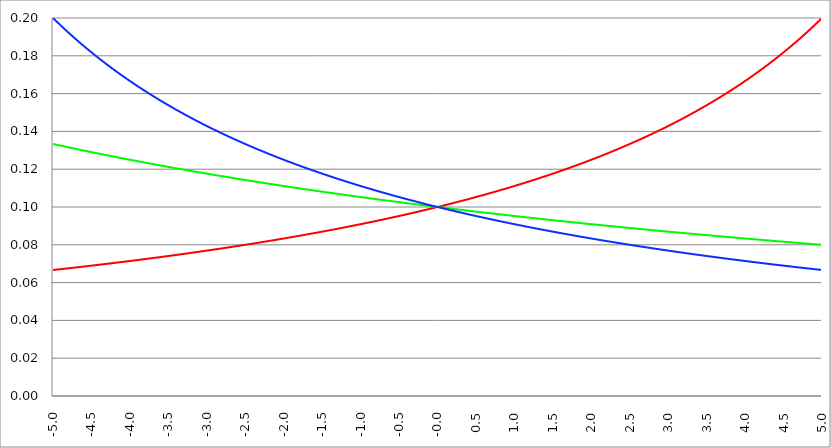
| Category | Series 1 | Series 0 | Series 2 |
|---|---|---|---|
| -5.0 | 0.067 | 0.133 | 0.2 |
| -4.995 | 0.067 | 0.133 | 0.2 |
| -4.99 | 0.067 | 0.133 | 0.2 |
| -4.985 | 0.067 | 0.133 | 0.199 |
| -4.98 | 0.067 | 0.133 | 0.199 |
| -4.975 | 0.067 | 0.133 | 0.199 |
| -4.97 | 0.067 | 0.133 | 0.199 |
| -4.965000000000001 | 0.067 | 0.133 | 0.199 |
| -4.960000000000001 | 0.067 | 0.133 | 0.198 |
| -4.955000000000001 | 0.067 | 0.133 | 0.198 |
| -4.950000000000001 | 0.067 | 0.133 | 0.198 |
| -4.945000000000001 | 0.067 | 0.133 | 0.198 |
| -4.940000000000001 | 0.067 | 0.133 | 0.198 |
| -4.935000000000001 | 0.067 | 0.133 | 0.197 |
| -4.930000000000001 | 0.067 | 0.133 | 0.197 |
| -4.925000000000002 | 0.067 | 0.133 | 0.197 |
| -4.920000000000002 | 0.067 | 0.133 | 0.197 |
| -4.915000000000002 | 0.067 | 0.133 | 0.197 |
| -4.910000000000002 | 0.067 | 0.133 | 0.196 |
| -4.905000000000002 | 0.067 | 0.132 | 0.196 |
| -4.900000000000002 | 0.067 | 0.132 | 0.196 |
| -4.895000000000002 | 0.067 | 0.132 | 0.196 |
| -4.890000000000002 | 0.067 | 0.132 | 0.196 |
| -4.885000000000002 | 0.067 | 0.132 | 0.196 |
| -4.880000000000002 | 0.067 | 0.132 | 0.195 |
| -4.875000000000003 | 0.067 | 0.132 | 0.195 |
| -4.870000000000003 | 0.067 | 0.132 | 0.195 |
| -4.865000000000003 | 0.067 | 0.132 | 0.195 |
| -4.860000000000003 | 0.067 | 0.132 | 0.195 |
| -4.855000000000003 | 0.067 | 0.132 | 0.194 |
| -4.850000000000003 | 0.067 | 0.132 | 0.194 |
| -4.845000000000003 | 0.067 | 0.132 | 0.194 |
| -4.840000000000003 | 0.067 | 0.132 | 0.194 |
| -4.835000000000003 | 0.067 | 0.132 | 0.194 |
| -4.830000000000004 | 0.067 | 0.132 | 0.193 |
| -4.825000000000004 | 0.067 | 0.132 | 0.193 |
| -4.820000000000004 | 0.067 | 0.132 | 0.193 |
| -4.815000000000004 | 0.067 | 0.132 | 0.193 |
| -4.810000000000004 | 0.068 | 0.132 | 0.193 |
| -4.805000000000004 | 0.068 | 0.132 | 0.192 |
| -4.800000000000004 | 0.068 | 0.132 | 0.192 |
| -4.795000000000004 | 0.068 | 0.132 | 0.192 |
| -4.790000000000004 | 0.068 | 0.131 | 0.192 |
| -4.785000000000004 | 0.068 | 0.131 | 0.192 |
| -4.780000000000004 | 0.068 | 0.131 | 0.192 |
| -4.775000000000004 | 0.068 | 0.131 | 0.191 |
| -4.770000000000004 | 0.068 | 0.131 | 0.191 |
| -4.765000000000005 | 0.068 | 0.131 | 0.191 |
| -4.760000000000005 | 0.068 | 0.131 | 0.191 |
| -4.755000000000005 | 0.068 | 0.131 | 0.191 |
| -4.750000000000005 | 0.068 | 0.131 | 0.19 |
| -4.745000000000005 | 0.068 | 0.131 | 0.19 |
| -4.740000000000005 | 0.068 | 0.131 | 0.19 |
| -4.735000000000005 | 0.068 | 0.131 | 0.19 |
| -4.730000000000005 | 0.068 | 0.131 | 0.19 |
| -4.725000000000006 | 0.068 | 0.131 | 0.19 |
| -4.720000000000006 | 0.068 | 0.131 | 0.189 |
| -4.715000000000006 | 0.068 | 0.131 | 0.189 |
| -4.710000000000006 | 0.068 | 0.131 | 0.189 |
| -4.705000000000006 | 0.068 | 0.131 | 0.189 |
| -4.700000000000006 | 0.068 | 0.131 | 0.189 |
| -4.695000000000006 | 0.068 | 0.131 | 0.189 |
| -4.690000000000006 | 0.068 | 0.131 | 0.188 |
| -4.685000000000007 | 0.068 | 0.131 | 0.188 |
| -4.680000000000007 | 0.068 | 0.131 | 0.188 |
| -4.675000000000007 | 0.068 | 0.131 | 0.188 |
| -4.670000000000007 | 0.068 | 0.13 | 0.188 |
| -4.665000000000007 | 0.068 | 0.13 | 0.187 |
| -4.660000000000007 | 0.068 | 0.13 | 0.187 |
| -4.655000000000007 | 0.068 | 0.13 | 0.187 |
| -4.650000000000007 | 0.068 | 0.13 | 0.187 |
| -4.645000000000007 | 0.068 | 0.13 | 0.187 |
| -4.640000000000008 | 0.068 | 0.13 | 0.187 |
| -4.635000000000008 | 0.068 | 0.13 | 0.186 |
| -4.630000000000008 | 0.068 | 0.13 | 0.186 |
| -4.625000000000008 | 0.068 | 0.13 | 0.186 |
| -4.620000000000008 | 0.068 | 0.13 | 0.186 |
| -4.615000000000008 | 0.068 | 0.13 | 0.186 |
| -4.610000000000008 | 0.068 | 0.13 | 0.186 |
| -4.605000000000008 | 0.068 | 0.13 | 0.185 |
| -4.600000000000008 | 0.068 | 0.13 | 0.185 |
| -4.595000000000009 | 0.069 | 0.13 | 0.185 |
| -4.590000000000009 | 0.069 | 0.13 | 0.185 |
| -4.585000000000009 | 0.069 | 0.13 | 0.185 |
| -4.580000000000009 | 0.069 | 0.13 | 0.185 |
| -4.57500000000001 | 0.069 | 0.13 | 0.184 |
| -4.57000000000001 | 0.069 | 0.13 | 0.184 |
| -4.565000000000009 | 0.069 | 0.13 | 0.184 |
| -4.560000000000009 | 0.069 | 0.13 | 0.184 |
| -4.555000000000009 | 0.069 | 0.129 | 0.184 |
| -4.55000000000001 | 0.069 | 0.129 | 0.183 |
| -4.54500000000001 | 0.069 | 0.129 | 0.183 |
| -4.54000000000001 | 0.069 | 0.129 | 0.183 |
| -4.53500000000001 | 0.069 | 0.129 | 0.183 |
| -4.53000000000001 | 0.069 | 0.129 | 0.183 |
| -4.52500000000001 | 0.069 | 0.129 | 0.183 |
| -4.52000000000001 | 0.069 | 0.129 | 0.182 |
| -4.51500000000001 | 0.069 | 0.129 | 0.182 |
| -4.51000000000001 | 0.069 | 0.129 | 0.182 |
| -4.505000000000011 | 0.069 | 0.129 | 0.182 |
| -4.500000000000011 | 0.069 | 0.129 | 0.182 |
| -4.495000000000011 | 0.069 | 0.129 | 0.182 |
| -4.490000000000011 | 0.069 | 0.129 | 0.181 |
| -4.485000000000011 | 0.069 | 0.129 | 0.181 |
| -4.480000000000011 | 0.069 | 0.129 | 0.181 |
| -4.475000000000011 | 0.069 | 0.129 | 0.181 |
| -4.470000000000011 | 0.069 | 0.129 | 0.181 |
| -4.465000000000011 | 0.069 | 0.129 | 0.181 |
| -4.460000000000011 | 0.069 | 0.129 | 0.181 |
| -4.455000000000012 | 0.069 | 0.129 | 0.18 |
| -4.450000000000012 | 0.069 | 0.129 | 0.18 |
| -4.445000000000012 | 0.069 | 0.129 | 0.18 |
| -4.440000000000012 | 0.069 | 0.129 | 0.18 |
| -4.435000000000012 | 0.069 | 0.128 | 0.18 |
| -4.430000000000012 | 0.069 | 0.128 | 0.18 |
| -4.425000000000012 | 0.069 | 0.128 | 0.179 |
| -4.420000000000012 | 0.069 | 0.128 | 0.179 |
| -4.415000000000012 | 0.069 | 0.128 | 0.179 |
| -4.410000000000013 | 0.069 | 0.128 | 0.179 |
| -4.405000000000013 | 0.069 | 0.128 | 0.179 |
| -4.400000000000013 | 0.069 | 0.128 | 0.179 |
| -4.395000000000013 | 0.069 | 0.128 | 0.178 |
| -4.390000000000013 | 0.069 | 0.128 | 0.178 |
| -4.385000000000013 | 0.07 | 0.128 | 0.178 |
| -4.380000000000013 | 0.07 | 0.128 | 0.178 |
| -4.375000000000013 | 0.07 | 0.128 | 0.178 |
| -4.370000000000013 | 0.07 | 0.128 | 0.178 |
| -4.365000000000013 | 0.07 | 0.128 | 0.177 |
| -4.360000000000014 | 0.07 | 0.128 | 0.177 |
| -4.355000000000014 | 0.07 | 0.128 | 0.177 |
| -4.350000000000014 | 0.07 | 0.128 | 0.177 |
| -4.345000000000014 | 0.07 | 0.128 | 0.177 |
| -4.340000000000014 | 0.07 | 0.128 | 0.177 |
| -4.335000000000014 | 0.07 | 0.128 | 0.177 |
| -4.330000000000014 | 0.07 | 0.128 | 0.176 |
| -4.325000000000014 | 0.07 | 0.128 | 0.176 |
| -4.320000000000014 | 0.07 | 0.128 | 0.176 |
| -4.315000000000015 | 0.07 | 0.128 | 0.176 |
| -4.310000000000015 | 0.07 | 0.127 | 0.176 |
| -4.305000000000015 | 0.07 | 0.127 | 0.176 |
| -4.300000000000015 | 0.07 | 0.127 | 0.175 |
| -4.295000000000015 | 0.07 | 0.127 | 0.175 |
| -4.290000000000015 | 0.07 | 0.127 | 0.175 |
| -4.285000000000015 | 0.07 | 0.127 | 0.175 |
| -4.280000000000015 | 0.07 | 0.127 | 0.175 |
| -4.275000000000015 | 0.07 | 0.127 | 0.175 |
| -4.270000000000015 | 0.07 | 0.127 | 0.175 |
| -4.265000000000016 | 0.07 | 0.127 | 0.174 |
| -4.260000000000016 | 0.07 | 0.127 | 0.174 |
| -4.255000000000016 | 0.07 | 0.127 | 0.174 |
| -4.250000000000016 | 0.07 | 0.127 | 0.174 |
| -4.245000000000016 | 0.07 | 0.127 | 0.174 |
| -4.240000000000016 | 0.07 | 0.127 | 0.174 |
| -4.235000000000016 | 0.07 | 0.127 | 0.173 |
| -4.230000000000016 | 0.07 | 0.127 | 0.173 |
| -4.225000000000017 | 0.07 | 0.127 | 0.173 |
| -4.220000000000017 | 0.07 | 0.127 | 0.173 |
| -4.215000000000017 | 0.07 | 0.127 | 0.173 |
| -4.210000000000017 | 0.07 | 0.127 | 0.173 |
| -4.205000000000017 | 0.07 | 0.127 | 0.173 |
| -4.200000000000017 | 0.07 | 0.127 | 0.172 |
| -4.195000000000017 | 0.07 | 0.127 | 0.172 |
| -4.190000000000017 | 0.07 | 0.127 | 0.172 |
| -4.185000000000017 | 0.07 | 0.126 | 0.172 |
| -4.180000000000017 | 0.071 | 0.126 | 0.172 |
| -4.175000000000018 | 0.071 | 0.126 | 0.172 |
| -4.170000000000018 | 0.071 | 0.126 | 0.172 |
| -4.165000000000018 | 0.071 | 0.126 | 0.171 |
| -4.160000000000018 | 0.071 | 0.126 | 0.171 |
| -4.155000000000018 | 0.071 | 0.126 | 0.171 |
| -4.150000000000018 | 0.071 | 0.126 | 0.171 |
| -4.145000000000018 | 0.071 | 0.126 | 0.171 |
| -4.140000000000018 | 0.071 | 0.126 | 0.171 |
| -4.135000000000018 | 0.071 | 0.126 | 0.171 |
| -4.130000000000019 | 0.071 | 0.126 | 0.17 |
| -4.125000000000019 | 0.071 | 0.126 | 0.17 |
| -4.120000000000019 | 0.071 | 0.126 | 0.17 |
| -4.115000000000019 | 0.071 | 0.126 | 0.17 |
| -4.110000000000019 | 0.071 | 0.126 | 0.17 |
| -4.105000000000019 | 0.071 | 0.126 | 0.17 |
| -4.100000000000019 | 0.071 | 0.126 | 0.169 |
| -4.095000000000019 | 0.071 | 0.126 | 0.169 |
| -4.090000000000019 | 0.071 | 0.126 | 0.169 |
| -4.085000000000019 | 0.071 | 0.126 | 0.169 |
| -4.08000000000002 | 0.071 | 0.126 | 0.169 |
| -4.07500000000002 | 0.071 | 0.126 | 0.169 |
| -4.07000000000002 | 0.071 | 0.126 | 0.169 |
| -4.06500000000002 | 0.071 | 0.126 | 0.168 |
| -4.06000000000002 | 0.071 | 0.125 | 0.168 |
| -4.05500000000002 | 0.071 | 0.125 | 0.168 |
| -4.05000000000002 | 0.071 | 0.125 | 0.168 |
| -4.04500000000002 | 0.071 | 0.125 | 0.168 |
| -4.04000000000002 | 0.071 | 0.125 | 0.168 |
| -4.03500000000002 | 0.071 | 0.125 | 0.168 |
| -4.03000000000002 | 0.071 | 0.125 | 0.168 |
| -4.025000000000021 | 0.071 | 0.125 | 0.167 |
| -4.020000000000021 | 0.071 | 0.125 | 0.167 |
| -4.015000000000021 | 0.071 | 0.125 | 0.167 |
| -4.010000000000021 | 0.071 | 0.125 | 0.167 |
| -4.005000000000021 | 0.071 | 0.125 | 0.167 |
| -4.000000000000021 | 0.071 | 0.125 | 0.167 |
| -3.995000000000021 | 0.071 | 0.125 | 0.167 |
| -3.990000000000021 | 0.071 | 0.125 | 0.166 |
| -3.985000000000022 | 0.072 | 0.125 | 0.166 |
| -3.980000000000022 | 0.072 | 0.125 | 0.166 |
| -3.975000000000022 | 0.072 | 0.125 | 0.166 |
| -3.970000000000022 | 0.072 | 0.125 | 0.166 |
| -3.965000000000022 | 0.072 | 0.125 | 0.166 |
| -3.960000000000022 | 0.072 | 0.125 | 0.166 |
| -3.955000000000022 | 0.072 | 0.125 | 0.165 |
| -3.950000000000022 | 0.072 | 0.125 | 0.165 |
| -3.945000000000022 | 0.072 | 0.125 | 0.165 |
| -3.940000000000023 | 0.072 | 0.125 | 0.165 |
| -3.935000000000023 | 0.072 | 0.124 | 0.165 |
| -3.930000000000023 | 0.072 | 0.124 | 0.165 |
| -3.925000000000023 | 0.072 | 0.124 | 0.165 |
| -3.920000000000023 | 0.072 | 0.124 | 0.164 |
| -3.915000000000023 | 0.072 | 0.124 | 0.164 |
| -3.910000000000023 | 0.072 | 0.124 | 0.164 |
| -3.905000000000023 | 0.072 | 0.124 | 0.164 |
| -3.900000000000023 | 0.072 | 0.124 | 0.164 |
| -3.895000000000023 | 0.072 | 0.124 | 0.164 |
| -3.890000000000024 | 0.072 | 0.124 | 0.164 |
| -3.885000000000024 | 0.072 | 0.124 | 0.164 |
| -3.880000000000024 | 0.072 | 0.124 | 0.163 |
| -3.875000000000024 | 0.072 | 0.124 | 0.163 |
| -3.870000000000024 | 0.072 | 0.124 | 0.163 |
| -3.865000000000024 | 0.072 | 0.124 | 0.163 |
| -3.860000000000024 | 0.072 | 0.124 | 0.163 |
| -3.855000000000024 | 0.072 | 0.124 | 0.163 |
| -3.850000000000024 | 0.072 | 0.124 | 0.163 |
| -3.845000000000025 | 0.072 | 0.124 | 0.162 |
| -3.840000000000025 | 0.072 | 0.124 | 0.162 |
| -3.835000000000025 | 0.072 | 0.124 | 0.162 |
| -3.830000000000025 | 0.072 | 0.124 | 0.162 |
| -3.825000000000025 | 0.072 | 0.124 | 0.162 |
| -3.820000000000025 | 0.072 | 0.124 | 0.162 |
| -3.815000000000025 | 0.072 | 0.124 | 0.162 |
| -3.810000000000025 | 0.072 | 0.124 | 0.162 |
| -3.805000000000025 | 0.072 | 0.123 | 0.161 |
| -3.800000000000026 | 0.072 | 0.123 | 0.161 |
| -3.795000000000026 | 0.072 | 0.123 | 0.161 |
| -3.790000000000026 | 0.073 | 0.123 | 0.161 |
| -3.785000000000026 | 0.073 | 0.123 | 0.161 |
| -3.780000000000026 | 0.073 | 0.123 | 0.161 |
| -3.775000000000026 | 0.073 | 0.123 | 0.161 |
| -3.770000000000026 | 0.073 | 0.123 | 0.161 |
| -3.765000000000026 | 0.073 | 0.123 | 0.16 |
| -3.760000000000026 | 0.073 | 0.123 | 0.16 |
| -3.755000000000026 | 0.073 | 0.123 | 0.16 |
| -3.750000000000027 | 0.073 | 0.123 | 0.16 |
| -3.745000000000027 | 0.073 | 0.123 | 0.16 |
| -3.740000000000027 | 0.073 | 0.123 | 0.16 |
| -3.735000000000027 | 0.073 | 0.123 | 0.16 |
| -3.730000000000027 | 0.073 | 0.123 | 0.159 |
| -3.725000000000027 | 0.073 | 0.123 | 0.159 |
| -3.720000000000027 | 0.073 | 0.123 | 0.159 |
| -3.715000000000027 | 0.073 | 0.123 | 0.159 |
| -3.710000000000027 | 0.073 | 0.123 | 0.159 |
| -3.705000000000028 | 0.073 | 0.123 | 0.159 |
| -3.700000000000028 | 0.073 | 0.123 | 0.159 |
| -3.695000000000028 | 0.073 | 0.123 | 0.159 |
| -3.690000000000028 | 0.073 | 0.123 | 0.158 |
| -3.685000000000028 | 0.073 | 0.123 | 0.158 |
| -3.680000000000028 | 0.073 | 0.123 | 0.158 |
| -3.675000000000028 | 0.073 | 0.123 | 0.158 |
| -3.670000000000028 | 0.073 | 0.122 | 0.158 |
| -3.665000000000028 | 0.073 | 0.122 | 0.158 |
| -3.660000000000028 | 0.073 | 0.122 | 0.158 |
| -3.655000000000029 | 0.073 | 0.122 | 0.158 |
| -3.650000000000029 | 0.073 | 0.122 | 0.157 |
| -3.645000000000029 | 0.073 | 0.122 | 0.157 |
| -3.640000000000029 | 0.073 | 0.122 | 0.157 |
| -3.635000000000029 | 0.073 | 0.122 | 0.157 |
| -3.630000000000029 | 0.073 | 0.122 | 0.157 |
| -3.625000000000029 | 0.073 | 0.122 | 0.157 |
| -3.620000000000029 | 0.073 | 0.122 | 0.157 |
| -3.615000000000029 | 0.073 | 0.122 | 0.157 |
| -3.61000000000003 | 0.073 | 0.122 | 0.156 |
| -3.60500000000003 | 0.074 | 0.122 | 0.156 |
| -3.60000000000003 | 0.074 | 0.122 | 0.156 |
| -3.59500000000003 | 0.074 | 0.122 | 0.156 |
| -3.59000000000003 | 0.074 | 0.122 | 0.156 |
| -3.58500000000003 | 0.074 | 0.122 | 0.156 |
| -3.58000000000003 | 0.074 | 0.122 | 0.156 |
| -3.57500000000003 | 0.074 | 0.122 | 0.156 |
| -3.57000000000003 | 0.074 | 0.122 | 0.156 |
| -3.565000000000031 | 0.074 | 0.122 | 0.155 |
| -3.560000000000031 | 0.074 | 0.122 | 0.155 |
| -3.555000000000031 | 0.074 | 0.122 | 0.155 |
| -3.550000000000031 | 0.074 | 0.122 | 0.155 |
| -3.545000000000031 | 0.074 | 0.122 | 0.155 |
| -3.540000000000031 | 0.074 | 0.122 | 0.155 |
| -3.535000000000031 | 0.074 | 0.121 | 0.155 |
| -3.530000000000031 | 0.074 | 0.121 | 0.155 |
| -3.525000000000031 | 0.074 | 0.121 | 0.154 |
| -3.520000000000032 | 0.074 | 0.121 | 0.154 |
| -3.515000000000032 | 0.074 | 0.121 | 0.154 |
| -3.510000000000032 | 0.074 | 0.121 | 0.154 |
| -3.505000000000032 | 0.074 | 0.121 | 0.154 |
| -3.500000000000032 | 0.074 | 0.121 | 0.154 |
| -3.495000000000032 | 0.074 | 0.121 | 0.154 |
| -3.490000000000032 | 0.074 | 0.121 | 0.154 |
| -3.485000000000032 | 0.074 | 0.121 | 0.153 |
| -3.480000000000032 | 0.074 | 0.121 | 0.153 |
| -3.475000000000032 | 0.074 | 0.121 | 0.153 |
| -3.470000000000033 | 0.074 | 0.121 | 0.153 |
| -3.465000000000033 | 0.074 | 0.121 | 0.153 |
| -3.460000000000033 | 0.074 | 0.121 | 0.153 |
| -3.455000000000033 | 0.074 | 0.121 | 0.153 |
| -3.450000000000033 | 0.074 | 0.121 | 0.153 |
| -3.445000000000033 | 0.074 | 0.121 | 0.153 |
| -3.440000000000033 | 0.074 | 0.121 | 0.152 |
| -3.435000000000033 | 0.074 | 0.121 | 0.152 |
| -3.430000000000033 | 0.074 | 0.121 | 0.152 |
| -3.425000000000034 | 0.074 | 0.121 | 0.152 |
| -3.420000000000034 | 0.075 | 0.121 | 0.152 |
| -3.415000000000034 | 0.075 | 0.121 | 0.152 |
| -3.410000000000034 | 0.075 | 0.121 | 0.152 |
| -3.405000000000034 | 0.075 | 0.121 | 0.152 |
| -3.400000000000034 | 0.075 | 0.12 | 0.152 |
| -3.395000000000034 | 0.075 | 0.12 | 0.151 |
| -3.390000000000034 | 0.075 | 0.12 | 0.151 |
| -3.385000000000034 | 0.075 | 0.12 | 0.151 |
| -3.380000000000034 | 0.075 | 0.12 | 0.151 |
| -3.375000000000035 | 0.075 | 0.12 | 0.151 |
| -3.370000000000035 | 0.075 | 0.12 | 0.151 |
| -3.365000000000035 | 0.075 | 0.12 | 0.151 |
| -3.360000000000035 | 0.075 | 0.12 | 0.151 |
| -3.355000000000035 | 0.075 | 0.12 | 0.15 |
| -3.350000000000035 | 0.075 | 0.12 | 0.15 |
| -3.345000000000035 | 0.075 | 0.12 | 0.15 |
| -3.340000000000035 | 0.075 | 0.12 | 0.15 |
| -3.335000000000035 | 0.075 | 0.12 | 0.15 |
| -3.330000000000036 | 0.075 | 0.12 | 0.15 |
| -3.325000000000036 | 0.075 | 0.12 | 0.15 |
| -3.320000000000036 | 0.075 | 0.12 | 0.15 |
| -3.315000000000036 | 0.075 | 0.12 | 0.15 |
| -3.310000000000036 | 0.075 | 0.12 | 0.149 |
| -3.305000000000036 | 0.075 | 0.12 | 0.149 |
| -3.300000000000036 | 0.075 | 0.12 | 0.149 |
| -3.295000000000036 | 0.075 | 0.12 | 0.149 |
| -3.290000000000036 | 0.075 | 0.12 | 0.149 |
| -3.285000000000036 | 0.075 | 0.12 | 0.149 |
| -3.280000000000036 | 0.075 | 0.12 | 0.149 |
| -3.275000000000037 | 0.075 | 0.12 | 0.149 |
| -3.270000000000037 | 0.075 | 0.12 | 0.149 |
| -3.265000000000037 | 0.075 | 0.12 | 0.148 |
| -3.260000000000037 | 0.075 | 0.119 | 0.148 |
| -3.255000000000037 | 0.075 | 0.119 | 0.148 |
| -3.250000000000037 | 0.075 | 0.119 | 0.148 |
| -3.245000000000037 | 0.076 | 0.119 | 0.148 |
| -3.240000000000037 | 0.076 | 0.119 | 0.148 |
| -3.235000000000038 | 0.076 | 0.119 | 0.148 |
| -3.230000000000038 | 0.076 | 0.119 | 0.148 |
| -3.225000000000038 | 0.076 | 0.119 | 0.148 |
| -3.220000000000038 | 0.076 | 0.119 | 0.147 |
| -3.215000000000038 | 0.076 | 0.119 | 0.147 |
| -3.210000000000038 | 0.076 | 0.119 | 0.147 |
| -3.205000000000038 | 0.076 | 0.119 | 0.147 |
| -3.200000000000038 | 0.076 | 0.119 | 0.147 |
| -3.195000000000038 | 0.076 | 0.119 | 0.147 |
| -3.190000000000039 | 0.076 | 0.119 | 0.147 |
| -3.185000000000039 | 0.076 | 0.119 | 0.147 |
| -3.180000000000039 | 0.076 | 0.119 | 0.147 |
| -3.175000000000039 | 0.076 | 0.119 | 0.147 |
| -3.170000000000039 | 0.076 | 0.119 | 0.146 |
| -3.16500000000004 | 0.076 | 0.119 | 0.146 |
| -3.16000000000004 | 0.076 | 0.119 | 0.146 |
| -3.155000000000039 | 0.076 | 0.119 | 0.146 |
| -3.150000000000039 | 0.076 | 0.119 | 0.146 |
| -3.14500000000004 | 0.076 | 0.119 | 0.146 |
| -3.14000000000004 | 0.076 | 0.119 | 0.146 |
| -3.13500000000004 | 0.076 | 0.119 | 0.146 |
| -3.13000000000004 | 0.076 | 0.119 | 0.146 |
| -3.12500000000004 | 0.076 | 0.119 | 0.145 |
| -3.12000000000004 | 0.076 | 0.118 | 0.145 |
| -3.11500000000004 | 0.076 | 0.118 | 0.145 |
| -3.11000000000004 | 0.076 | 0.118 | 0.145 |
| -3.10500000000004 | 0.076 | 0.118 | 0.145 |
| -3.10000000000004 | 0.076 | 0.118 | 0.145 |
| -3.095000000000041 | 0.076 | 0.118 | 0.145 |
| -3.090000000000041 | 0.076 | 0.118 | 0.145 |
| -3.085000000000041 | 0.076 | 0.118 | 0.145 |
| -3.080000000000041 | 0.076 | 0.118 | 0.145 |
| -3.075000000000041 | 0.076 | 0.118 | 0.144 |
| -3.070000000000041 | 0.077 | 0.118 | 0.144 |
| -3.065000000000041 | 0.077 | 0.118 | 0.144 |
| -3.060000000000041 | 0.077 | 0.118 | 0.144 |
| -3.055000000000041 | 0.077 | 0.118 | 0.144 |
| -3.050000000000042 | 0.077 | 0.118 | 0.144 |
| -3.045000000000042 | 0.077 | 0.118 | 0.144 |
| -3.040000000000042 | 0.077 | 0.118 | 0.144 |
| -3.035000000000042 | 0.077 | 0.118 | 0.144 |
| -3.030000000000042 | 0.077 | 0.118 | 0.143 |
| -3.025000000000042 | 0.077 | 0.118 | 0.143 |
| -3.020000000000042 | 0.077 | 0.118 | 0.143 |
| -3.015000000000042 | 0.077 | 0.118 | 0.143 |
| -3.010000000000042 | 0.077 | 0.118 | 0.143 |
| -3.005000000000043 | 0.077 | 0.118 | 0.143 |
| -3.000000000000043 | 0.077 | 0.118 | 0.143 |
| -2.995000000000043 | 0.077 | 0.118 | 0.143 |
| -2.990000000000043 | 0.077 | 0.118 | 0.143 |
| -2.985000000000043 | 0.077 | 0.118 | 0.143 |
| -2.980000000000043 | 0.077 | 0.118 | 0.142 |
| -2.975000000000043 | 0.077 | 0.117 | 0.142 |
| -2.970000000000043 | 0.077 | 0.117 | 0.142 |
| -2.965000000000043 | 0.077 | 0.117 | 0.142 |
| -2.960000000000043 | 0.077 | 0.117 | 0.142 |
| -2.955000000000044 | 0.077 | 0.117 | 0.142 |
| -2.950000000000044 | 0.077 | 0.117 | 0.142 |
| -2.945000000000044 | 0.077 | 0.117 | 0.142 |
| -2.940000000000044 | 0.077 | 0.117 | 0.142 |
| -2.935000000000044 | 0.077 | 0.117 | 0.142 |
| -2.930000000000044 | 0.077 | 0.117 | 0.141 |
| -2.925000000000044 | 0.077 | 0.117 | 0.141 |
| -2.920000000000044 | 0.077 | 0.117 | 0.141 |
| -2.915000000000044 | 0.077 | 0.117 | 0.141 |
| -2.910000000000045 | 0.077 | 0.117 | 0.141 |
| -2.905000000000045 | 0.077 | 0.117 | 0.141 |
| -2.900000000000045 | 0.078 | 0.117 | 0.141 |
| -2.895000000000045 | 0.078 | 0.117 | 0.141 |
| -2.890000000000045 | 0.078 | 0.117 | 0.141 |
| -2.885000000000045 | 0.078 | 0.117 | 0.141 |
| -2.880000000000045 | 0.078 | 0.117 | 0.14 |
| -2.875000000000045 | 0.078 | 0.117 | 0.14 |
| -2.870000000000045 | 0.078 | 0.117 | 0.14 |
| -2.865000000000045 | 0.078 | 0.117 | 0.14 |
| -2.860000000000046 | 0.078 | 0.117 | 0.14 |
| -2.855000000000046 | 0.078 | 0.117 | 0.14 |
| -2.850000000000046 | 0.078 | 0.117 | 0.14 |
| -2.845000000000046 | 0.078 | 0.117 | 0.14 |
| -2.840000000000046 | 0.078 | 0.117 | 0.14 |
| -2.835000000000046 | 0.078 | 0.117 | 0.14 |
| -2.830000000000046 | 0.078 | 0.116 | 0.139 |
| -2.825000000000046 | 0.078 | 0.116 | 0.139 |
| -2.820000000000046 | 0.078 | 0.116 | 0.139 |
| -2.815000000000047 | 0.078 | 0.116 | 0.139 |
| -2.810000000000047 | 0.078 | 0.116 | 0.139 |
| -2.805000000000047 | 0.078 | 0.116 | 0.139 |
| -2.800000000000047 | 0.078 | 0.116 | 0.139 |
| -2.795000000000047 | 0.078 | 0.116 | 0.139 |
| -2.790000000000047 | 0.078 | 0.116 | 0.139 |
| -2.785000000000047 | 0.078 | 0.116 | 0.139 |
| -2.780000000000047 | 0.078 | 0.116 | 0.139 |
| -2.775000000000047 | 0.078 | 0.116 | 0.138 |
| -2.770000000000047 | 0.078 | 0.116 | 0.138 |
| -2.765000000000048 | 0.078 | 0.116 | 0.138 |
| -2.760000000000048 | 0.078 | 0.116 | 0.138 |
| -2.755000000000048 | 0.078 | 0.116 | 0.138 |
| -2.750000000000048 | 0.078 | 0.116 | 0.138 |
| -2.745000000000048 | 0.078 | 0.116 | 0.138 |
| -2.740000000000048 | 0.078 | 0.116 | 0.138 |
| -2.735000000000048 | 0.079 | 0.116 | 0.138 |
| -2.730000000000048 | 0.079 | 0.116 | 0.138 |
| -2.725000000000048 | 0.079 | 0.116 | 0.137 |
| -2.720000000000049 | 0.079 | 0.116 | 0.137 |
| -2.715000000000049 | 0.079 | 0.116 | 0.137 |
| -2.710000000000049 | 0.079 | 0.116 | 0.137 |
| -2.705000000000049 | 0.079 | 0.116 | 0.137 |
| -2.700000000000049 | 0.079 | 0.116 | 0.137 |
| -2.695000000000049 | 0.079 | 0.116 | 0.137 |
| -2.690000000000049 | 0.079 | 0.116 | 0.137 |
| -2.685000000000049 | 0.079 | 0.116 | 0.137 |
| -2.680000000000049 | 0.079 | 0.115 | 0.137 |
| -2.675000000000049 | 0.079 | 0.115 | 0.137 |
| -2.67000000000005 | 0.079 | 0.115 | 0.136 |
| -2.66500000000005 | 0.079 | 0.115 | 0.136 |
| -2.66000000000005 | 0.079 | 0.115 | 0.136 |
| -2.65500000000005 | 0.079 | 0.115 | 0.136 |
| -2.65000000000005 | 0.079 | 0.115 | 0.136 |
| -2.64500000000005 | 0.079 | 0.115 | 0.136 |
| -2.64000000000005 | 0.079 | 0.115 | 0.136 |
| -2.63500000000005 | 0.079 | 0.115 | 0.136 |
| -2.63000000000005 | 0.079 | 0.115 | 0.136 |
| -2.625000000000051 | 0.079 | 0.115 | 0.136 |
| -2.620000000000051 | 0.079 | 0.115 | 0.136 |
| -2.615000000000051 | 0.079 | 0.115 | 0.135 |
| -2.610000000000051 | 0.079 | 0.115 | 0.135 |
| -2.605000000000051 | 0.079 | 0.115 | 0.135 |
| -2.600000000000051 | 0.079 | 0.115 | 0.135 |
| -2.595000000000051 | 0.079 | 0.115 | 0.135 |
| -2.590000000000051 | 0.079 | 0.115 | 0.135 |
| -2.585000000000051 | 0.079 | 0.115 | 0.135 |
| -2.580000000000052 | 0.079 | 0.115 | 0.135 |
| -2.575000000000052 | 0.08 | 0.115 | 0.135 |
| -2.570000000000052 | 0.08 | 0.115 | 0.135 |
| -2.565000000000052 | 0.08 | 0.115 | 0.134 |
| -2.560000000000052 | 0.08 | 0.115 | 0.134 |
| -2.555000000000052 | 0.08 | 0.115 | 0.134 |
| -2.550000000000052 | 0.08 | 0.115 | 0.134 |
| -2.545000000000052 | 0.08 | 0.115 | 0.134 |
| -2.540000000000052 | 0.08 | 0.115 | 0.134 |
| -2.535000000000053 | 0.08 | 0.115 | 0.134 |
| -2.530000000000053 | 0.08 | 0.114 | 0.134 |
| -2.525000000000053 | 0.08 | 0.114 | 0.134 |
| -2.520000000000053 | 0.08 | 0.114 | 0.134 |
| -2.515000000000053 | 0.08 | 0.114 | 0.134 |
| -2.510000000000053 | 0.08 | 0.114 | 0.134 |
| -2.505000000000053 | 0.08 | 0.114 | 0.133 |
| -2.500000000000053 | 0.08 | 0.114 | 0.133 |
| -2.495000000000053 | 0.08 | 0.114 | 0.133 |
| -2.490000000000053 | 0.08 | 0.114 | 0.133 |
| -2.485000000000054 | 0.08 | 0.114 | 0.133 |
| -2.480000000000054 | 0.08 | 0.114 | 0.133 |
| -2.475000000000054 | 0.08 | 0.114 | 0.133 |
| -2.470000000000054 | 0.08 | 0.114 | 0.133 |
| -2.465000000000054 | 0.08 | 0.114 | 0.133 |
| -2.460000000000054 | 0.08 | 0.114 | 0.133 |
| -2.455000000000054 | 0.08 | 0.114 | 0.133 |
| -2.450000000000054 | 0.08 | 0.114 | 0.132 |
| -2.445000000000054 | 0.08 | 0.114 | 0.132 |
| -2.440000000000055 | 0.08 | 0.114 | 0.132 |
| -2.435000000000055 | 0.08 | 0.114 | 0.132 |
| -2.430000000000055 | 0.08 | 0.114 | 0.132 |
| -2.425000000000055 | 0.08 | 0.114 | 0.132 |
| -2.420000000000055 | 0.081 | 0.114 | 0.132 |
| -2.415000000000055 | 0.081 | 0.114 | 0.132 |
| -2.410000000000055 | 0.081 | 0.114 | 0.132 |
| -2.405000000000055 | 0.081 | 0.114 | 0.132 |
| -2.400000000000055 | 0.081 | 0.114 | 0.132 |
| -2.395000000000055 | 0.081 | 0.114 | 0.131 |
| -2.390000000000056 | 0.081 | 0.114 | 0.131 |
| -2.385000000000056 | 0.081 | 0.114 | 0.131 |
| -2.380000000000056 | 0.081 | 0.114 | 0.131 |
| -2.375000000000056 | 0.081 | 0.113 | 0.131 |
| -2.370000000000056 | 0.081 | 0.113 | 0.131 |
| -2.365000000000056 | 0.081 | 0.113 | 0.131 |
| -2.360000000000056 | 0.081 | 0.113 | 0.131 |
| -2.355000000000056 | 0.081 | 0.113 | 0.131 |
| -2.350000000000056 | 0.081 | 0.113 | 0.131 |
| -2.345000000000057 | 0.081 | 0.113 | 0.131 |
| -2.340000000000057 | 0.081 | 0.113 | 0.131 |
| -2.335000000000057 | 0.081 | 0.113 | 0.13 |
| -2.330000000000057 | 0.081 | 0.113 | 0.13 |
| -2.325000000000057 | 0.081 | 0.113 | 0.13 |
| -2.320000000000057 | 0.081 | 0.113 | 0.13 |
| -2.315000000000057 | 0.081 | 0.113 | 0.13 |
| -2.310000000000057 | 0.081 | 0.113 | 0.13 |
| -2.305000000000057 | 0.081 | 0.113 | 0.13 |
| -2.300000000000058 | 0.081 | 0.113 | 0.13 |
| -2.295000000000058 | 0.081 | 0.113 | 0.13 |
| -2.290000000000058 | 0.081 | 0.113 | 0.13 |
| -2.285000000000058 | 0.081 | 0.113 | 0.13 |
| -2.280000000000058 | 0.081 | 0.113 | 0.13 |
| -2.275000000000058 | 0.081 | 0.113 | 0.129 |
| -2.270000000000058 | 0.081 | 0.113 | 0.129 |
| -2.265000000000058 | 0.082 | 0.113 | 0.129 |
| -2.260000000000058 | 0.082 | 0.113 | 0.129 |
| -2.255000000000058 | 0.082 | 0.113 | 0.129 |
| -2.250000000000059 | 0.082 | 0.113 | 0.129 |
| -2.245000000000059 | 0.082 | 0.113 | 0.129 |
| -2.240000000000059 | 0.082 | 0.113 | 0.129 |
| -2.235000000000059 | 0.082 | 0.113 | 0.129 |
| -2.23000000000006 | 0.082 | 0.113 | 0.129 |
| -2.22500000000006 | 0.082 | 0.113 | 0.129 |
| -2.22000000000006 | 0.082 | 0.112 | 0.129 |
| -2.215000000000059 | 0.082 | 0.112 | 0.128 |
| -2.210000000000059 | 0.082 | 0.112 | 0.128 |
| -2.20500000000006 | 0.082 | 0.112 | 0.128 |
| -2.20000000000006 | 0.082 | 0.112 | 0.128 |
| -2.19500000000006 | 0.082 | 0.112 | 0.128 |
| -2.19000000000006 | 0.082 | 0.112 | 0.128 |
| -2.18500000000006 | 0.082 | 0.112 | 0.128 |
| -2.18000000000006 | 0.082 | 0.112 | 0.128 |
| -2.17500000000006 | 0.082 | 0.112 | 0.128 |
| -2.17000000000006 | 0.082 | 0.112 | 0.128 |
| -2.16500000000006 | 0.082 | 0.112 | 0.128 |
| -2.160000000000061 | 0.082 | 0.112 | 0.128 |
| -2.155000000000061 | 0.082 | 0.112 | 0.127 |
| -2.150000000000061 | 0.082 | 0.112 | 0.127 |
| -2.145000000000061 | 0.082 | 0.112 | 0.127 |
| -2.140000000000061 | 0.082 | 0.112 | 0.127 |
| -2.135000000000061 | 0.082 | 0.112 | 0.127 |
| -2.130000000000061 | 0.082 | 0.112 | 0.127 |
| -2.125000000000061 | 0.082 | 0.112 | 0.127 |
| -2.120000000000061 | 0.083 | 0.112 | 0.127 |
| -2.115000000000061 | 0.083 | 0.112 | 0.127 |
| -2.110000000000062 | 0.083 | 0.112 | 0.127 |
| -2.105000000000062 | 0.083 | 0.112 | 0.127 |
| -2.100000000000062 | 0.083 | 0.112 | 0.127 |
| -2.095000000000062 | 0.083 | 0.112 | 0.127 |
| -2.090000000000062 | 0.083 | 0.112 | 0.126 |
| -2.085000000000062 | 0.083 | 0.112 | 0.126 |
| -2.080000000000062 | 0.083 | 0.112 | 0.126 |
| -2.075000000000062 | 0.083 | 0.112 | 0.126 |
| -2.070000000000062 | 0.083 | 0.112 | 0.126 |
| -2.065000000000063 | 0.083 | 0.112 | 0.126 |
| -2.060000000000063 | 0.083 | 0.111 | 0.126 |
| -2.055000000000063 | 0.083 | 0.111 | 0.126 |
| -2.050000000000063 | 0.083 | 0.111 | 0.126 |
| -2.045000000000063 | 0.083 | 0.111 | 0.126 |
| -2.040000000000063 | 0.083 | 0.111 | 0.126 |
| -2.035000000000063 | 0.083 | 0.111 | 0.126 |
| -2.030000000000063 | 0.083 | 0.111 | 0.125 |
| -2.025000000000063 | 0.083 | 0.111 | 0.125 |
| -2.020000000000064 | 0.083 | 0.111 | 0.125 |
| -2.015000000000064 | 0.083 | 0.111 | 0.125 |
| -2.010000000000064 | 0.083 | 0.111 | 0.125 |
| -2.005000000000064 | 0.083 | 0.111 | 0.125 |
| -2.000000000000064 | 0.083 | 0.111 | 0.125 |
| -1.995000000000064 | 0.083 | 0.111 | 0.125 |
| -1.990000000000064 | 0.083 | 0.111 | 0.125 |
| -1.985000000000064 | 0.083 | 0.111 | 0.125 |
| -1.980000000000064 | 0.083 | 0.111 | 0.125 |
| -1.975000000000064 | 0.084 | 0.111 | 0.125 |
| -1.970000000000065 | 0.084 | 0.111 | 0.125 |
| -1.965000000000065 | 0.084 | 0.111 | 0.124 |
| -1.960000000000065 | 0.084 | 0.111 | 0.124 |
| -1.955000000000065 | 0.084 | 0.111 | 0.124 |
| -1.950000000000065 | 0.084 | 0.111 | 0.124 |
| -1.945000000000065 | 0.084 | 0.111 | 0.124 |
| -1.940000000000065 | 0.084 | 0.111 | 0.124 |
| -1.935000000000065 | 0.084 | 0.111 | 0.124 |
| -1.930000000000065 | 0.084 | 0.111 | 0.124 |
| -1.925000000000066 | 0.084 | 0.111 | 0.124 |
| -1.920000000000066 | 0.084 | 0.111 | 0.124 |
| -1.915000000000066 | 0.084 | 0.111 | 0.124 |
| -1.910000000000066 | 0.084 | 0.111 | 0.124 |
| -1.905000000000066 | 0.084 | 0.111 | 0.124 |
| -1.900000000000066 | 0.084 | 0.11 | 0.123 |
| -1.895000000000066 | 0.084 | 0.11 | 0.123 |
| -1.890000000000066 | 0.084 | 0.11 | 0.123 |
| -1.885000000000066 | 0.084 | 0.11 | 0.123 |
| -1.880000000000066 | 0.084 | 0.11 | 0.123 |
| -1.875000000000067 | 0.084 | 0.11 | 0.123 |
| -1.870000000000067 | 0.084 | 0.11 | 0.123 |
| -1.865000000000067 | 0.084 | 0.11 | 0.123 |
| -1.860000000000067 | 0.084 | 0.11 | 0.123 |
| -1.855000000000067 | 0.084 | 0.11 | 0.123 |
| -1.850000000000067 | 0.084 | 0.11 | 0.123 |
| -1.845000000000067 | 0.084 | 0.11 | 0.123 |
| -1.840000000000067 | 0.084 | 0.11 | 0.123 |
| -1.835000000000067 | 0.084 | 0.11 | 0.122 |
| -1.830000000000068 | 0.085 | 0.11 | 0.122 |
| -1.825000000000068 | 0.085 | 0.11 | 0.122 |
| -1.820000000000068 | 0.085 | 0.11 | 0.122 |
| -1.815000000000068 | 0.085 | 0.11 | 0.122 |
| -1.810000000000068 | 0.085 | 0.11 | 0.122 |
| -1.805000000000068 | 0.085 | 0.11 | 0.122 |
| -1.800000000000068 | 0.085 | 0.11 | 0.122 |
| -1.795000000000068 | 0.085 | 0.11 | 0.122 |
| -1.790000000000068 | 0.085 | 0.11 | 0.122 |
| -1.785000000000068 | 0.085 | 0.11 | 0.122 |
| -1.780000000000069 | 0.085 | 0.11 | 0.122 |
| -1.775000000000069 | 0.085 | 0.11 | 0.122 |
| -1.770000000000069 | 0.085 | 0.11 | 0.122 |
| -1.765000000000069 | 0.085 | 0.11 | 0.121 |
| -1.760000000000069 | 0.085 | 0.11 | 0.121 |
| -1.75500000000007 | 0.085 | 0.11 | 0.121 |
| -1.75000000000007 | 0.085 | 0.11 | 0.121 |
| -1.745000000000069 | 0.085 | 0.11 | 0.121 |
| -1.740000000000069 | 0.085 | 0.11 | 0.121 |
| -1.73500000000007 | 0.085 | 0.109 | 0.121 |
| -1.73000000000007 | 0.085 | 0.109 | 0.121 |
| -1.72500000000007 | 0.085 | 0.109 | 0.121 |
| -1.72000000000007 | 0.085 | 0.109 | 0.121 |
| -1.71500000000007 | 0.085 | 0.109 | 0.121 |
| -1.71000000000007 | 0.085 | 0.109 | 0.121 |
| -1.70500000000007 | 0.085 | 0.109 | 0.121 |
| -1.70000000000007 | 0.085 | 0.109 | 0.12 |
| -1.69500000000007 | 0.086 | 0.109 | 0.12 |
| -1.69000000000007 | 0.086 | 0.109 | 0.12 |
| -1.685000000000071 | 0.086 | 0.109 | 0.12 |
| -1.680000000000071 | 0.086 | 0.109 | 0.12 |
| -1.675000000000071 | 0.086 | 0.109 | 0.12 |
| -1.670000000000071 | 0.086 | 0.109 | 0.12 |
| -1.665000000000071 | 0.086 | 0.109 | 0.12 |
| -1.660000000000071 | 0.086 | 0.109 | 0.12 |
| -1.655000000000071 | 0.086 | 0.109 | 0.12 |
| -1.650000000000071 | 0.086 | 0.109 | 0.12 |
| -1.645000000000071 | 0.086 | 0.109 | 0.12 |
| -1.640000000000072 | 0.086 | 0.109 | 0.12 |
| -1.635000000000072 | 0.086 | 0.109 | 0.12 |
| -1.630000000000072 | 0.086 | 0.109 | 0.119 |
| -1.625000000000072 | 0.086 | 0.109 | 0.119 |
| -1.620000000000072 | 0.086 | 0.109 | 0.119 |
| -1.615000000000072 | 0.086 | 0.109 | 0.119 |
| -1.610000000000072 | 0.086 | 0.109 | 0.119 |
| -1.605000000000072 | 0.086 | 0.109 | 0.119 |
| -1.600000000000072 | 0.086 | 0.109 | 0.119 |
| -1.595000000000073 | 0.086 | 0.109 | 0.119 |
| -1.590000000000073 | 0.086 | 0.109 | 0.119 |
| -1.585000000000073 | 0.086 | 0.109 | 0.119 |
| -1.580000000000073 | 0.086 | 0.109 | 0.119 |
| -1.575000000000073 | 0.086 | 0.109 | 0.119 |
| -1.570000000000073 | 0.086 | 0.109 | 0.119 |
| -1.565000000000073 | 0.086 | 0.108 | 0.119 |
| -1.560000000000073 | 0.087 | 0.108 | 0.118 |
| -1.555000000000073 | 0.087 | 0.108 | 0.118 |
| -1.550000000000074 | 0.087 | 0.108 | 0.118 |
| -1.545000000000074 | 0.087 | 0.108 | 0.118 |
| -1.540000000000074 | 0.087 | 0.108 | 0.118 |
| -1.535000000000074 | 0.087 | 0.108 | 0.118 |
| -1.530000000000074 | 0.087 | 0.108 | 0.118 |
| -1.525000000000074 | 0.087 | 0.108 | 0.118 |
| -1.520000000000074 | 0.087 | 0.108 | 0.118 |
| -1.515000000000074 | 0.087 | 0.108 | 0.118 |
| -1.510000000000074 | 0.087 | 0.108 | 0.118 |
| -1.505000000000074 | 0.087 | 0.108 | 0.118 |
| -1.500000000000075 | 0.087 | 0.108 | 0.118 |
| -1.495000000000075 | 0.087 | 0.108 | 0.118 |
| -1.490000000000075 | 0.087 | 0.108 | 0.118 |
| -1.485000000000075 | 0.087 | 0.108 | 0.117 |
| -1.480000000000075 | 0.087 | 0.108 | 0.117 |
| -1.475000000000075 | 0.087 | 0.108 | 0.117 |
| -1.470000000000075 | 0.087 | 0.108 | 0.117 |
| -1.465000000000075 | 0.087 | 0.108 | 0.117 |
| -1.460000000000075 | 0.087 | 0.108 | 0.117 |
| -1.455000000000076 | 0.087 | 0.108 | 0.117 |
| -1.450000000000076 | 0.087 | 0.108 | 0.117 |
| -1.445000000000076 | 0.087 | 0.108 | 0.117 |
| -1.440000000000076 | 0.087 | 0.108 | 0.117 |
| -1.435000000000076 | 0.087 | 0.108 | 0.117 |
| -1.430000000000076 | 0.087 | 0.108 | 0.117 |
| -1.425000000000076 | 0.088 | 0.108 | 0.117 |
| -1.420000000000076 | 0.088 | 0.108 | 0.117 |
| -1.415000000000076 | 0.088 | 0.108 | 0.116 |
| -1.410000000000077 | 0.088 | 0.108 | 0.116 |
| -1.405000000000077 | 0.088 | 0.108 | 0.116 |
| -1.400000000000077 | 0.088 | 0.108 | 0.116 |
| -1.395000000000077 | 0.088 | 0.107 | 0.116 |
| -1.390000000000077 | 0.088 | 0.107 | 0.116 |
| -1.385000000000077 | 0.088 | 0.107 | 0.116 |
| -1.380000000000077 | 0.088 | 0.107 | 0.116 |
| -1.375000000000077 | 0.088 | 0.107 | 0.116 |
| -1.370000000000077 | 0.088 | 0.107 | 0.116 |
| -1.365000000000077 | 0.088 | 0.107 | 0.116 |
| -1.360000000000078 | 0.088 | 0.107 | 0.116 |
| -1.355000000000078 | 0.088 | 0.107 | 0.116 |
| -1.350000000000078 | 0.088 | 0.107 | 0.116 |
| -1.345000000000078 | 0.088 | 0.107 | 0.116 |
| -1.340000000000078 | 0.088 | 0.107 | 0.115 |
| -1.335000000000078 | 0.088 | 0.107 | 0.115 |
| -1.330000000000078 | 0.088 | 0.107 | 0.115 |
| -1.325000000000078 | 0.088 | 0.107 | 0.115 |
| -1.320000000000078 | 0.088 | 0.107 | 0.115 |
| -1.315000000000079 | 0.088 | 0.107 | 0.115 |
| -1.310000000000079 | 0.088 | 0.107 | 0.115 |
| -1.305000000000079 | 0.088 | 0.107 | 0.115 |
| -1.300000000000079 | 0.088 | 0.107 | 0.115 |
| -1.295000000000079 | 0.089 | 0.107 | 0.115 |
| -1.29000000000008 | 0.089 | 0.107 | 0.115 |
| -1.285000000000079 | 0.089 | 0.107 | 0.115 |
| -1.280000000000079 | 0.089 | 0.107 | 0.115 |
| -1.275000000000079 | 0.089 | 0.107 | 0.115 |
| -1.270000000000079 | 0.089 | 0.107 | 0.115 |
| -1.26500000000008 | 0.089 | 0.107 | 0.114 |
| -1.26000000000008 | 0.089 | 0.107 | 0.114 |
| -1.25500000000008 | 0.089 | 0.107 | 0.114 |
| -1.25000000000008 | 0.089 | 0.107 | 0.114 |
| -1.24500000000008 | 0.089 | 0.107 | 0.114 |
| -1.24000000000008 | 0.089 | 0.107 | 0.114 |
| -1.23500000000008 | 0.089 | 0.107 | 0.114 |
| -1.23000000000008 | 0.089 | 0.107 | 0.114 |
| -1.22500000000008 | 0.089 | 0.107 | 0.114 |
| -1.220000000000081 | 0.089 | 0.106 | 0.114 |
| -1.215000000000081 | 0.089 | 0.106 | 0.114 |
| -1.210000000000081 | 0.089 | 0.106 | 0.114 |
| -1.205000000000081 | 0.089 | 0.106 | 0.114 |
| -1.200000000000081 | 0.089 | 0.106 | 0.114 |
| -1.195000000000081 | 0.089 | 0.106 | 0.114 |
| -1.190000000000081 | 0.089 | 0.106 | 0.114 |
| -1.185000000000081 | 0.089 | 0.106 | 0.113 |
| -1.180000000000081 | 0.089 | 0.106 | 0.113 |
| -1.175000000000082 | 0.089 | 0.106 | 0.113 |
| -1.170000000000082 | 0.09 | 0.106 | 0.113 |
| -1.165000000000082 | 0.09 | 0.106 | 0.113 |
| -1.160000000000082 | 0.09 | 0.106 | 0.113 |
| -1.155000000000082 | 0.09 | 0.106 | 0.113 |
| -1.150000000000082 | 0.09 | 0.106 | 0.113 |
| -1.145000000000082 | 0.09 | 0.106 | 0.113 |
| -1.140000000000082 | 0.09 | 0.106 | 0.113 |
| -1.135000000000082 | 0.09 | 0.106 | 0.113 |
| -1.130000000000082 | 0.09 | 0.106 | 0.113 |
| -1.125000000000083 | 0.09 | 0.106 | 0.113 |
| -1.120000000000083 | 0.09 | 0.106 | 0.113 |
| -1.115000000000083 | 0.09 | 0.106 | 0.113 |
| -1.110000000000083 | 0.09 | 0.106 | 0.112 |
| -1.105000000000083 | 0.09 | 0.106 | 0.112 |
| -1.100000000000083 | 0.09 | 0.106 | 0.112 |
| -1.095000000000083 | 0.09 | 0.106 | 0.112 |
| -1.090000000000083 | 0.09 | 0.106 | 0.112 |
| -1.085000000000083 | 0.09 | 0.106 | 0.112 |
| -1.080000000000084 | 0.09 | 0.106 | 0.112 |
| -1.075000000000084 | 0.09 | 0.106 | 0.112 |
| -1.070000000000084 | 0.09 | 0.106 | 0.112 |
| -1.065000000000084 | 0.09 | 0.106 | 0.112 |
| -1.060000000000084 | 0.09 | 0.106 | 0.112 |
| -1.055000000000084 | 0.09 | 0.106 | 0.112 |
| -1.050000000000084 | 0.09 | 0.106 | 0.112 |
| -1.045000000000084 | 0.091 | 0.106 | 0.112 |
| -1.040000000000084 | 0.091 | 0.105 | 0.112 |
| -1.035000000000085 | 0.091 | 0.105 | 0.112 |
| -1.030000000000085 | 0.091 | 0.105 | 0.111 |
| -1.025000000000085 | 0.091 | 0.105 | 0.111 |
| -1.020000000000085 | 0.091 | 0.105 | 0.111 |
| -1.015000000000085 | 0.091 | 0.105 | 0.111 |
| -1.010000000000085 | 0.091 | 0.105 | 0.111 |
| -1.005000000000085 | 0.091 | 0.105 | 0.111 |
| -1.000000000000085 | 0.091 | 0.105 | 0.111 |
| -0.995000000000085 | 0.091 | 0.105 | 0.111 |
| -0.990000000000085 | 0.091 | 0.105 | 0.111 |
| -0.985000000000085 | 0.091 | 0.105 | 0.111 |
| -0.980000000000085 | 0.091 | 0.105 | 0.111 |
| -0.975000000000085 | 0.091 | 0.105 | 0.111 |
| -0.970000000000085 | 0.091 | 0.105 | 0.111 |
| -0.965000000000085 | 0.091 | 0.105 | 0.111 |
| -0.960000000000085 | 0.091 | 0.105 | 0.111 |
| -0.955000000000085 | 0.091 | 0.105 | 0.111 |
| -0.950000000000085 | 0.091 | 0.105 | 0.11 |
| -0.945000000000085 | 0.091 | 0.105 | 0.11 |
| -0.940000000000085 | 0.091 | 0.105 | 0.11 |
| -0.935000000000085 | 0.091 | 0.105 | 0.11 |
| -0.930000000000085 | 0.091 | 0.105 | 0.11 |
| -0.925000000000085 | 0.092 | 0.105 | 0.11 |
| -0.920000000000085 | 0.092 | 0.105 | 0.11 |
| -0.915000000000085 | 0.092 | 0.105 | 0.11 |
| -0.910000000000085 | 0.092 | 0.105 | 0.11 |
| -0.905000000000085 | 0.092 | 0.105 | 0.11 |
| -0.900000000000085 | 0.092 | 0.105 | 0.11 |
| -0.895000000000085 | 0.092 | 0.105 | 0.11 |
| -0.890000000000085 | 0.092 | 0.105 | 0.11 |
| -0.885000000000085 | 0.092 | 0.105 | 0.11 |
| -0.880000000000085 | 0.092 | 0.105 | 0.11 |
| -0.875000000000085 | 0.092 | 0.105 | 0.11 |
| -0.870000000000085 | 0.092 | 0.105 | 0.11 |
| -0.865000000000085 | 0.092 | 0.105 | 0.109 |
| -0.860000000000085 | 0.092 | 0.104 | 0.109 |
| -0.855000000000085 | 0.092 | 0.104 | 0.109 |
| -0.850000000000085 | 0.092 | 0.104 | 0.109 |
| -0.845000000000085 | 0.092 | 0.104 | 0.109 |
| -0.840000000000085 | 0.092 | 0.104 | 0.109 |
| -0.835000000000085 | 0.092 | 0.104 | 0.109 |
| -0.830000000000085 | 0.092 | 0.104 | 0.109 |
| -0.825000000000085 | 0.092 | 0.104 | 0.109 |
| -0.820000000000085 | 0.092 | 0.104 | 0.109 |
| -0.815000000000085 | 0.092 | 0.104 | 0.109 |
| -0.810000000000085 | 0.093 | 0.104 | 0.109 |
| -0.805000000000085 | 0.093 | 0.104 | 0.109 |
| -0.800000000000085 | 0.093 | 0.104 | 0.109 |
| -0.795000000000085 | 0.093 | 0.104 | 0.109 |
| -0.790000000000085 | 0.093 | 0.104 | 0.109 |
| -0.785000000000085 | 0.093 | 0.104 | 0.109 |
| -0.780000000000085 | 0.093 | 0.104 | 0.108 |
| -0.775000000000085 | 0.093 | 0.104 | 0.108 |
| -0.770000000000085 | 0.093 | 0.104 | 0.108 |
| -0.765000000000085 | 0.093 | 0.104 | 0.108 |
| -0.760000000000085 | 0.093 | 0.104 | 0.108 |
| -0.755000000000085 | 0.093 | 0.104 | 0.108 |
| -0.750000000000085 | 0.093 | 0.104 | 0.108 |
| -0.745000000000085 | 0.093 | 0.104 | 0.108 |
| -0.740000000000085 | 0.093 | 0.104 | 0.108 |
| -0.735000000000085 | 0.093 | 0.104 | 0.108 |
| -0.730000000000085 | 0.093 | 0.104 | 0.108 |
| -0.725000000000085 | 0.093 | 0.104 | 0.108 |
| -0.720000000000085 | 0.093 | 0.104 | 0.108 |
| -0.715000000000085 | 0.093 | 0.104 | 0.108 |
| -0.710000000000085 | 0.093 | 0.104 | 0.108 |
| -0.705000000000085 | 0.093 | 0.104 | 0.108 |
| -0.700000000000085 | 0.093 | 0.104 | 0.108 |
| -0.695000000000085 | 0.094 | 0.104 | 0.107 |
| -0.690000000000085 | 0.094 | 0.104 | 0.107 |
| -0.685000000000085 | 0.094 | 0.104 | 0.107 |
| -0.680000000000085 | 0.094 | 0.104 | 0.107 |
| -0.675000000000085 | 0.094 | 0.103 | 0.107 |
| -0.670000000000085 | 0.094 | 0.103 | 0.107 |
| -0.665000000000085 | 0.094 | 0.103 | 0.107 |
| -0.660000000000085 | 0.094 | 0.103 | 0.107 |
| -0.655000000000085 | 0.094 | 0.103 | 0.107 |
| -0.650000000000085 | 0.094 | 0.103 | 0.107 |
| -0.645000000000085 | 0.094 | 0.103 | 0.107 |
| -0.640000000000085 | 0.094 | 0.103 | 0.107 |
| -0.635000000000085 | 0.094 | 0.103 | 0.107 |
| -0.630000000000085 | 0.094 | 0.103 | 0.107 |
| -0.625000000000085 | 0.094 | 0.103 | 0.107 |
| -0.620000000000085 | 0.094 | 0.103 | 0.107 |
| -0.615000000000085 | 0.094 | 0.103 | 0.107 |
| -0.610000000000085 | 0.094 | 0.103 | 0.106 |
| -0.605000000000085 | 0.094 | 0.103 | 0.106 |
| -0.600000000000085 | 0.094 | 0.103 | 0.106 |
| -0.595000000000085 | 0.094 | 0.103 | 0.106 |
| -0.590000000000085 | 0.094 | 0.103 | 0.106 |
| -0.585000000000085 | 0.094 | 0.103 | 0.106 |
| -0.580000000000085 | 0.095 | 0.103 | 0.106 |
| -0.575000000000085 | 0.095 | 0.103 | 0.106 |
| -0.570000000000085 | 0.095 | 0.103 | 0.106 |
| -0.565000000000085 | 0.095 | 0.103 | 0.106 |
| -0.560000000000085 | 0.095 | 0.103 | 0.106 |
| -0.555000000000085 | 0.095 | 0.103 | 0.106 |
| -0.550000000000085 | 0.095 | 0.103 | 0.106 |
| -0.545000000000085 | 0.095 | 0.103 | 0.106 |
| -0.540000000000085 | 0.095 | 0.103 | 0.106 |
| -0.535000000000085 | 0.095 | 0.103 | 0.106 |
| -0.530000000000085 | 0.095 | 0.103 | 0.106 |
| -0.525000000000085 | 0.095 | 0.103 | 0.106 |
| -0.520000000000085 | 0.095 | 0.103 | 0.105 |
| -0.515000000000085 | 0.095 | 0.103 | 0.105 |
| -0.510000000000085 | 0.095 | 0.103 | 0.105 |
| -0.505000000000085 | 0.095 | 0.103 | 0.105 |
| -0.500000000000085 | 0.095 | 0.103 | 0.105 |
| -0.495000000000085 | 0.095 | 0.103 | 0.105 |
| -0.490000000000085 | 0.095 | 0.103 | 0.105 |
| -0.485000000000085 | 0.095 | 0.102 | 0.105 |
| -0.480000000000085 | 0.095 | 0.102 | 0.105 |
| -0.475000000000085 | 0.095 | 0.102 | 0.105 |
| -0.470000000000085 | 0.096 | 0.102 | 0.105 |
| -0.465000000000085 | 0.096 | 0.102 | 0.105 |
| -0.460000000000085 | 0.096 | 0.102 | 0.105 |
| -0.455000000000085 | 0.096 | 0.102 | 0.105 |
| -0.450000000000085 | 0.096 | 0.102 | 0.105 |
| -0.445000000000085 | 0.096 | 0.102 | 0.105 |
| -0.440000000000085 | 0.096 | 0.102 | 0.105 |
| -0.435000000000085 | 0.096 | 0.102 | 0.105 |
| -0.430000000000085 | 0.096 | 0.102 | 0.104 |
| -0.425000000000085 | 0.096 | 0.102 | 0.104 |
| -0.420000000000085 | 0.096 | 0.102 | 0.104 |
| -0.415000000000085 | 0.096 | 0.102 | 0.104 |
| -0.410000000000085 | 0.096 | 0.102 | 0.104 |
| -0.405000000000085 | 0.096 | 0.102 | 0.104 |
| -0.400000000000085 | 0.096 | 0.102 | 0.104 |
| -0.395000000000085 | 0.096 | 0.102 | 0.104 |
| -0.390000000000085 | 0.096 | 0.102 | 0.104 |
| -0.385000000000085 | 0.096 | 0.102 | 0.104 |
| -0.380000000000085 | 0.096 | 0.102 | 0.104 |
| -0.375000000000085 | 0.096 | 0.102 | 0.104 |
| -0.370000000000085 | 0.096 | 0.102 | 0.104 |
| -0.365000000000085 | 0.096 | 0.102 | 0.104 |
| -0.360000000000085 | 0.097 | 0.102 | 0.104 |
| -0.355000000000085 | 0.097 | 0.102 | 0.104 |
| -0.350000000000085 | 0.097 | 0.102 | 0.104 |
| -0.345000000000085 | 0.097 | 0.102 | 0.104 |
| -0.340000000000085 | 0.097 | 0.102 | 0.104 |
| -0.335000000000085 | 0.097 | 0.102 | 0.103 |
| -0.330000000000085 | 0.097 | 0.102 | 0.103 |
| -0.325000000000085 | 0.097 | 0.102 | 0.103 |
| -0.320000000000085 | 0.097 | 0.102 | 0.103 |
| -0.315000000000085 | 0.097 | 0.102 | 0.103 |
| -0.310000000000085 | 0.097 | 0.102 | 0.103 |
| -0.305000000000085 | 0.097 | 0.102 | 0.103 |
| -0.300000000000085 | 0.097 | 0.102 | 0.103 |
| -0.295000000000085 | 0.097 | 0.101 | 0.103 |
| -0.290000000000085 | 0.097 | 0.101 | 0.103 |
| -0.285000000000085 | 0.097 | 0.101 | 0.103 |
| -0.280000000000085 | 0.097 | 0.101 | 0.103 |
| -0.275000000000085 | 0.097 | 0.101 | 0.103 |
| -0.270000000000085 | 0.097 | 0.101 | 0.103 |
| -0.265000000000085 | 0.097 | 0.101 | 0.103 |
| -0.260000000000085 | 0.097 | 0.101 | 0.103 |
| -0.255000000000085 | 0.098 | 0.101 | 0.103 |
| -0.250000000000085 | 0.098 | 0.101 | 0.103 |
| -0.245000000000085 | 0.098 | 0.101 | 0.103 |
| -0.240000000000085 | 0.098 | 0.101 | 0.102 |
| -0.235000000000085 | 0.098 | 0.101 | 0.102 |
| -0.230000000000085 | 0.098 | 0.101 | 0.102 |
| -0.225000000000085 | 0.098 | 0.101 | 0.102 |
| -0.220000000000085 | 0.098 | 0.101 | 0.102 |
| -0.215000000000085 | 0.098 | 0.101 | 0.102 |
| -0.210000000000085 | 0.098 | 0.101 | 0.102 |
| -0.205000000000085 | 0.098 | 0.101 | 0.102 |
| -0.200000000000085 | 0.098 | 0.101 | 0.102 |
| -0.195000000000085 | 0.098 | 0.101 | 0.102 |
| -0.190000000000085 | 0.098 | 0.101 | 0.102 |
| -0.185000000000085 | 0.098 | 0.101 | 0.102 |
| -0.180000000000085 | 0.098 | 0.101 | 0.102 |
| -0.175000000000085 | 0.098 | 0.101 | 0.102 |
| -0.170000000000085 | 0.098 | 0.101 | 0.102 |
| -0.165000000000085 | 0.098 | 0.101 | 0.102 |
| -0.160000000000085 | 0.098 | 0.101 | 0.102 |
| -0.155000000000084 | 0.098 | 0.101 | 0.102 |
| -0.150000000000084 | 0.099 | 0.101 | 0.102 |
| -0.145000000000084 | 0.099 | 0.101 | 0.101 |
| -0.140000000000084 | 0.099 | 0.101 | 0.101 |
| -0.135000000000084 | 0.099 | 0.101 | 0.101 |
| -0.130000000000084 | 0.099 | 0.101 | 0.101 |
| -0.125000000000084 | 0.099 | 0.101 | 0.101 |
| -0.120000000000084 | 0.099 | 0.101 | 0.101 |
| -0.115000000000084 | 0.099 | 0.101 | 0.101 |
| -0.110000000000084 | 0.099 | 0.101 | 0.101 |
| -0.105000000000084 | 0.099 | 0.101 | 0.101 |
| -0.100000000000084 | 0.099 | 0.101 | 0.101 |
| -0.0950000000000844 | 0.099 | 0.1 | 0.101 |
| -0.0900000000000844 | 0.099 | 0.1 | 0.101 |
| -0.0850000000000844 | 0.099 | 0.1 | 0.101 |
| -0.0800000000000844 | 0.099 | 0.1 | 0.101 |
| -0.0750000000000844 | 0.099 | 0.1 | 0.101 |
| -0.0700000000000844 | 0.099 | 0.1 | 0.101 |
| -0.0650000000000844 | 0.099 | 0.1 | 0.101 |
| -0.0600000000000844 | 0.099 | 0.1 | 0.101 |
| -0.0550000000000844 | 0.099 | 0.1 | 0.101 |
| -0.0500000000000844 | 0.1 | 0.1 | 0.101 |
| -0.0450000000000844 | 0.1 | 0.1 | 0.1 |
| -0.0400000000000844 | 0.1 | 0.1 | 0.1 |
| -0.0350000000000844 | 0.1 | 0.1 | 0.1 |
| -0.0300000000000844 | 0.1 | 0.1 | 0.1 |
| -0.0250000000000844 | 0.1 | 0.1 | 0.1 |
| -0.0200000000000844 | 0.1 | 0.1 | 0.1 |
| -0.0150000000000844 | 0.1 | 0.1 | 0.1 |
| -0.0100000000000844 | 0.1 | 0.1 | 0.1 |
| -0.00500000000008444 | 0.1 | 0.1 | 0.1 |
| -8.4444604087075e-14 | 0.1 | 0.1 | 0.1 |
| 0.00499999999991555 | 0.1 | 0.1 | 0.1 |
| 0.00999999999991555 | 0.1 | 0.1 | 0.1 |
| 0.0149999999999156 | 0.1 | 0.1 | 0.1 |
| 0.0199999999999156 | 0.1 | 0.1 | 0.1 |
| 0.0249999999999156 | 0.1 | 0.1 | 0.1 |
| 0.0299999999999156 | 0.1 | 0.1 | 0.1 |
| 0.0349999999999155 | 0.1 | 0.1 | 0.1 |
| 0.0399999999999155 | 0.1 | 0.1 | 0.1 |
| 0.0449999999999155 | 0.1 | 0.1 | 0.1 |
| 0.0499999999999155 | 0.101 | 0.1 | 0.1 |
| 0.0549999999999155 | 0.101 | 0.1 | 0.099 |
| 0.0599999999999155 | 0.101 | 0.1 | 0.099 |
| 0.0649999999999155 | 0.101 | 0.1 | 0.099 |
| 0.0699999999999155 | 0.101 | 0.1 | 0.099 |
| 0.0749999999999155 | 0.101 | 0.1 | 0.099 |
| 0.0799999999999155 | 0.101 | 0.1 | 0.099 |
| 0.0849999999999155 | 0.101 | 0.1 | 0.099 |
| 0.0899999999999155 | 0.101 | 0.1 | 0.099 |
| 0.0949999999999155 | 0.101 | 0.1 | 0.099 |
| 0.0999999999999155 | 0.101 | 0.1 | 0.099 |
| 0.104999999999916 | 0.101 | 0.099 | 0.099 |
| 0.109999999999916 | 0.101 | 0.099 | 0.099 |
| 0.114999999999916 | 0.101 | 0.099 | 0.099 |
| 0.119999999999916 | 0.101 | 0.099 | 0.099 |
| 0.124999999999916 | 0.101 | 0.099 | 0.099 |
| 0.129999999999916 | 0.101 | 0.099 | 0.099 |
| 0.134999999999916 | 0.101 | 0.099 | 0.099 |
| 0.139999999999916 | 0.101 | 0.099 | 0.099 |
| 0.144999999999916 | 0.101 | 0.099 | 0.099 |
| 0.149999999999916 | 0.102 | 0.099 | 0.099 |
| 0.154999999999916 | 0.102 | 0.099 | 0.098 |
| 0.159999999999916 | 0.102 | 0.099 | 0.098 |
| 0.164999999999916 | 0.102 | 0.099 | 0.098 |
| 0.169999999999916 | 0.102 | 0.099 | 0.098 |
| 0.174999999999916 | 0.102 | 0.099 | 0.098 |
| 0.179999999999916 | 0.102 | 0.099 | 0.098 |
| 0.184999999999916 | 0.102 | 0.099 | 0.098 |
| 0.189999999999916 | 0.102 | 0.099 | 0.098 |
| 0.194999999999916 | 0.102 | 0.099 | 0.098 |
| 0.199999999999916 | 0.102 | 0.099 | 0.098 |
| 0.204999999999916 | 0.102 | 0.099 | 0.098 |
| 0.209999999999916 | 0.102 | 0.099 | 0.098 |
| 0.214999999999916 | 0.102 | 0.099 | 0.098 |
| 0.219999999999916 | 0.102 | 0.099 | 0.098 |
| 0.224999999999916 | 0.102 | 0.099 | 0.098 |
| 0.229999999999916 | 0.102 | 0.099 | 0.098 |
| 0.234999999999916 | 0.102 | 0.099 | 0.098 |
| 0.239999999999916 | 0.102 | 0.099 | 0.098 |
| 0.244999999999916 | 0.103 | 0.099 | 0.098 |
| 0.249999999999916 | 0.103 | 0.099 | 0.098 |
| 0.254999999999916 | 0.103 | 0.099 | 0.098 |
| 0.259999999999916 | 0.103 | 0.099 | 0.097 |
| 0.264999999999916 | 0.103 | 0.099 | 0.097 |
| 0.269999999999916 | 0.103 | 0.099 | 0.097 |
| 0.274999999999916 | 0.103 | 0.099 | 0.097 |
| 0.279999999999916 | 0.103 | 0.099 | 0.097 |
| 0.284999999999916 | 0.103 | 0.099 | 0.097 |
| 0.289999999999916 | 0.103 | 0.099 | 0.097 |
| 0.294999999999916 | 0.103 | 0.099 | 0.097 |
| 0.299999999999916 | 0.103 | 0.099 | 0.097 |
| 0.304999999999916 | 0.103 | 0.098 | 0.097 |
| 0.309999999999916 | 0.103 | 0.098 | 0.097 |
| 0.314999999999916 | 0.103 | 0.098 | 0.097 |
| 0.319999999999916 | 0.103 | 0.098 | 0.097 |
| 0.324999999999916 | 0.103 | 0.098 | 0.097 |
| 0.329999999999916 | 0.103 | 0.098 | 0.097 |
| 0.334999999999916 | 0.103 | 0.098 | 0.097 |
| 0.339999999999916 | 0.104 | 0.098 | 0.097 |
| 0.344999999999916 | 0.104 | 0.098 | 0.097 |
| 0.349999999999916 | 0.104 | 0.098 | 0.097 |
| 0.354999999999916 | 0.104 | 0.098 | 0.097 |
| 0.359999999999916 | 0.104 | 0.098 | 0.097 |
| 0.364999999999916 | 0.104 | 0.098 | 0.096 |
| 0.369999999999916 | 0.104 | 0.098 | 0.096 |
| 0.374999999999916 | 0.104 | 0.098 | 0.096 |
| 0.379999999999916 | 0.104 | 0.098 | 0.096 |
| 0.384999999999916 | 0.104 | 0.098 | 0.096 |
| 0.389999999999916 | 0.104 | 0.098 | 0.096 |
| 0.394999999999916 | 0.104 | 0.098 | 0.096 |
| 0.399999999999916 | 0.104 | 0.098 | 0.096 |
| 0.404999999999916 | 0.104 | 0.098 | 0.096 |
| 0.409999999999916 | 0.104 | 0.098 | 0.096 |
| 0.414999999999916 | 0.104 | 0.098 | 0.096 |
| 0.419999999999916 | 0.104 | 0.098 | 0.096 |
| 0.424999999999916 | 0.104 | 0.098 | 0.096 |
| 0.429999999999916 | 0.104 | 0.098 | 0.096 |
| 0.434999999999916 | 0.105 | 0.098 | 0.096 |
| 0.439999999999916 | 0.105 | 0.098 | 0.096 |
| 0.444999999999916 | 0.105 | 0.098 | 0.096 |
| 0.449999999999916 | 0.105 | 0.098 | 0.096 |
| 0.454999999999916 | 0.105 | 0.098 | 0.096 |
| 0.459999999999916 | 0.105 | 0.098 | 0.096 |
| 0.464999999999916 | 0.105 | 0.098 | 0.096 |
| 0.469999999999916 | 0.105 | 0.098 | 0.096 |
| 0.474999999999916 | 0.105 | 0.098 | 0.095 |
| 0.479999999999916 | 0.105 | 0.098 | 0.095 |
| 0.484999999999916 | 0.105 | 0.098 | 0.095 |
| 0.489999999999916 | 0.105 | 0.098 | 0.095 |
| 0.494999999999916 | 0.105 | 0.098 | 0.095 |
| 0.499999999999916 | 0.105 | 0.098 | 0.095 |
| 0.504999999999916 | 0.105 | 0.098 | 0.095 |
| 0.509999999999916 | 0.105 | 0.098 | 0.095 |
| 0.514999999999916 | 0.105 | 0.097 | 0.095 |
| 0.519999999999916 | 0.105 | 0.097 | 0.095 |
| 0.524999999999916 | 0.106 | 0.097 | 0.095 |
| 0.529999999999916 | 0.106 | 0.097 | 0.095 |
| 0.534999999999916 | 0.106 | 0.097 | 0.095 |
| 0.539999999999916 | 0.106 | 0.097 | 0.095 |
| 0.544999999999916 | 0.106 | 0.097 | 0.095 |
| 0.549999999999916 | 0.106 | 0.097 | 0.095 |
| 0.554999999999916 | 0.106 | 0.097 | 0.095 |
| 0.559999999999916 | 0.106 | 0.097 | 0.095 |
| 0.564999999999916 | 0.106 | 0.097 | 0.095 |
| 0.569999999999916 | 0.106 | 0.097 | 0.095 |
| 0.574999999999916 | 0.106 | 0.097 | 0.095 |
| 0.579999999999916 | 0.106 | 0.097 | 0.095 |
| 0.584999999999916 | 0.106 | 0.097 | 0.094 |
| 0.589999999999916 | 0.106 | 0.097 | 0.094 |
| 0.594999999999916 | 0.106 | 0.097 | 0.094 |
| 0.599999999999916 | 0.106 | 0.097 | 0.094 |
| 0.604999999999916 | 0.106 | 0.097 | 0.094 |
| 0.609999999999916 | 0.106 | 0.097 | 0.094 |
| 0.614999999999916 | 0.107 | 0.097 | 0.094 |
| 0.619999999999916 | 0.107 | 0.097 | 0.094 |
| 0.624999999999916 | 0.107 | 0.097 | 0.094 |
| 0.629999999999916 | 0.107 | 0.097 | 0.094 |
| 0.634999999999916 | 0.107 | 0.097 | 0.094 |
| 0.639999999999916 | 0.107 | 0.097 | 0.094 |
| 0.644999999999916 | 0.107 | 0.097 | 0.094 |
| 0.649999999999916 | 0.107 | 0.097 | 0.094 |
| 0.654999999999916 | 0.107 | 0.097 | 0.094 |
| 0.659999999999916 | 0.107 | 0.097 | 0.094 |
| 0.664999999999916 | 0.107 | 0.097 | 0.094 |
| 0.669999999999916 | 0.107 | 0.097 | 0.094 |
| 0.674999999999916 | 0.107 | 0.097 | 0.094 |
| 0.679999999999916 | 0.107 | 0.097 | 0.094 |
| 0.684999999999916 | 0.107 | 0.097 | 0.094 |
| 0.689999999999916 | 0.107 | 0.097 | 0.094 |
| 0.694999999999916 | 0.107 | 0.097 | 0.094 |
| 0.699999999999916 | 0.108 | 0.097 | 0.093 |
| 0.704999999999916 | 0.108 | 0.097 | 0.093 |
| 0.709999999999916 | 0.108 | 0.097 | 0.093 |
| 0.714999999999916 | 0.108 | 0.097 | 0.093 |
| 0.719999999999916 | 0.108 | 0.097 | 0.093 |
| 0.724999999999916 | 0.108 | 0.097 | 0.093 |
| 0.729999999999916 | 0.108 | 0.096 | 0.093 |
| 0.734999999999916 | 0.108 | 0.096 | 0.093 |
| 0.739999999999916 | 0.108 | 0.096 | 0.093 |
| 0.744999999999916 | 0.108 | 0.096 | 0.093 |
| 0.749999999999916 | 0.108 | 0.096 | 0.093 |
| 0.754999999999916 | 0.108 | 0.096 | 0.093 |
| 0.759999999999916 | 0.108 | 0.096 | 0.093 |
| 0.764999999999916 | 0.108 | 0.096 | 0.093 |
| 0.769999999999916 | 0.108 | 0.096 | 0.093 |
| 0.774999999999916 | 0.108 | 0.096 | 0.093 |
| 0.779999999999916 | 0.108 | 0.096 | 0.093 |
| 0.784999999999916 | 0.109 | 0.096 | 0.093 |
| 0.789999999999916 | 0.109 | 0.096 | 0.093 |
| 0.794999999999916 | 0.109 | 0.096 | 0.093 |
| 0.799999999999916 | 0.109 | 0.096 | 0.093 |
| 0.804999999999916 | 0.109 | 0.096 | 0.093 |
| 0.809999999999916 | 0.109 | 0.096 | 0.093 |
| 0.814999999999916 | 0.109 | 0.096 | 0.092 |
| 0.819999999999916 | 0.109 | 0.096 | 0.092 |
| 0.824999999999916 | 0.109 | 0.096 | 0.092 |
| 0.829999999999916 | 0.109 | 0.096 | 0.092 |
| 0.834999999999916 | 0.109 | 0.096 | 0.092 |
| 0.839999999999916 | 0.109 | 0.096 | 0.092 |
| 0.844999999999916 | 0.109 | 0.096 | 0.092 |
| 0.849999999999916 | 0.109 | 0.096 | 0.092 |
| 0.854999999999916 | 0.109 | 0.096 | 0.092 |
| 0.859999999999916 | 0.109 | 0.096 | 0.092 |
| 0.864999999999916 | 0.109 | 0.096 | 0.092 |
| 0.869999999999916 | 0.11 | 0.096 | 0.092 |
| 0.874999999999916 | 0.11 | 0.096 | 0.092 |
| 0.879999999999916 | 0.11 | 0.096 | 0.092 |
| 0.884999999999916 | 0.11 | 0.096 | 0.092 |
| 0.889999999999916 | 0.11 | 0.096 | 0.092 |
| 0.894999999999916 | 0.11 | 0.096 | 0.092 |
| 0.899999999999916 | 0.11 | 0.096 | 0.092 |
| 0.904999999999916 | 0.11 | 0.096 | 0.092 |
| 0.909999999999916 | 0.11 | 0.096 | 0.092 |
| 0.914999999999916 | 0.11 | 0.096 | 0.092 |
| 0.919999999999916 | 0.11 | 0.096 | 0.092 |
| 0.924999999999916 | 0.11 | 0.096 | 0.092 |
| 0.929999999999916 | 0.11 | 0.096 | 0.091 |
| 0.934999999999916 | 0.11 | 0.096 | 0.091 |
| 0.939999999999916 | 0.11 | 0.096 | 0.091 |
| 0.944999999999916 | 0.11 | 0.095 | 0.091 |
| 0.949999999999916 | 0.11 | 0.095 | 0.091 |
| 0.954999999999916 | 0.111 | 0.095 | 0.091 |
| 0.959999999999916 | 0.111 | 0.095 | 0.091 |
| 0.964999999999916 | 0.111 | 0.095 | 0.091 |
| 0.969999999999916 | 0.111 | 0.095 | 0.091 |
| 0.974999999999916 | 0.111 | 0.095 | 0.091 |
| 0.979999999999916 | 0.111 | 0.095 | 0.091 |
| 0.984999999999916 | 0.111 | 0.095 | 0.091 |
| 0.989999999999916 | 0.111 | 0.095 | 0.091 |
| 0.994999999999916 | 0.111 | 0.095 | 0.091 |
| 0.999999999999916 | 0.111 | 0.095 | 0.091 |
| 1.004999999999916 | 0.111 | 0.095 | 0.091 |
| 1.009999999999916 | 0.111 | 0.095 | 0.091 |
| 1.014999999999916 | 0.111 | 0.095 | 0.091 |
| 1.019999999999916 | 0.111 | 0.095 | 0.091 |
| 1.024999999999916 | 0.111 | 0.095 | 0.091 |
| 1.029999999999916 | 0.111 | 0.095 | 0.091 |
| 1.034999999999916 | 0.112 | 0.095 | 0.091 |
| 1.039999999999915 | 0.112 | 0.095 | 0.091 |
| 1.044999999999915 | 0.112 | 0.095 | 0.091 |
| 1.049999999999915 | 0.112 | 0.095 | 0.09 |
| 1.054999999999915 | 0.112 | 0.095 | 0.09 |
| 1.059999999999915 | 0.112 | 0.095 | 0.09 |
| 1.064999999999915 | 0.112 | 0.095 | 0.09 |
| 1.069999999999915 | 0.112 | 0.095 | 0.09 |
| 1.074999999999915 | 0.112 | 0.095 | 0.09 |
| 1.079999999999915 | 0.112 | 0.095 | 0.09 |
| 1.084999999999914 | 0.112 | 0.095 | 0.09 |
| 1.089999999999914 | 0.112 | 0.095 | 0.09 |
| 1.094999999999914 | 0.112 | 0.095 | 0.09 |
| 1.099999999999914 | 0.112 | 0.095 | 0.09 |
| 1.104999999999914 | 0.112 | 0.095 | 0.09 |
| 1.109999999999914 | 0.112 | 0.095 | 0.09 |
| 1.114999999999914 | 0.113 | 0.095 | 0.09 |
| 1.119999999999914 | 0.113 | 0.095 | 0.09 |
| 1.124999999999914 | 0.113 | 0.095 | 0.09 |
| 1.129999999999914 | 0.113 | 0.095 | 0.09 |
| 1.134999999999913 | 0.113 | 0.095 | 0.09 |
| 1.139999999999913 | 0.113 | 0.095 | 0.09 |
| 1.144999999999913 | 0.113 | 0.095 | 0.09 |
| 1.149999999999913 | 0.113 | 0.095 | 0.09 |
| 1.154999999999913 | 0.113 | 0.095 | 0.09 |
| 1.159999999999913 | 0.113 | 0.095 | 0.09 |
| 1.164999999999913 | 0.113 | 0.094 | 0.09 |
| 1.169999999999913 | 0.113 | 0.094 | 0.09 |
| 1.174999999999913 | 0.113 | 0.094 | 0.089 |
| 1.179999999999912 | 0.113 | 0.094 | 0.089 |
| 1.184999999999912 | 0.113 | 0.094 | 0.089 |
| 1.189999999999912 | 0.114 | 0.094 | 0.089 |
| 1.194999999999912 | 0.114 | 0.094 | 0.089 |
| 1.199999999999912 | 0.114 | 0.094 | 0.089 |
| 1.204999999999912 | 0.114 | 0.094 | 0.089 |
| 1.209999999999912 | 0.114 | 0.094 | 0.089 |
| 1.214999999999912 | 0.114 | 0.094 | 0.089 |
| 1.219999999999912 | 0.114 | 0.094 | 0.089 |
| 1.224999999999911 | 0.114 | 0.094 | 0.089 |
| 1.229999999999911 | 0.114 | 0.094 | 0.089 |
| 1.234999999999911 | 0.114 | 0.094 | 0.089 |
| 1.239999999999911 | 0.114 | 0.094 | 0.089 |
| 1.244999999999911 | 0.114 | 0.094 | 0.089 |
| 1.249999999999911 | 0.114 | 0.094 | 0.089 |
| 1.254999999999911 | 0.114 | 0.094 | 0.089 |
| 1.259999999999911 | 0.114 | 0.094 | 0.089 |
| 1.264999999999911 | 0.114 | 0.094 | 0.089 |
| 1.269999999999911 | 0.115 | 0.094 | 0.089 |
| 1.27499999999991 | 0.115 | 0.094 | 0.089 |
| 1.27999999999991 | 0.115 | 0.094 | 0.089 |
| 1.28499999999991 | 0.115 | 0.094 | 0.089 |
| 1.28999999999991 | 0.115 | 0.094 | 0.089 |
| 1.29499999999991 | 0.115 | 0.094 | 0.089 |
| 1.29999999999991 | 0.115 | 0.094 | 0.088 |
| 1.30499999999991 | 0.115 | 0.094 | 0.088 |
| 1.30999999999991 | 0.115 | 0.094 | 0.088 |
| 1.31499999999991 | 0.115 | 0.094 | 0.088 |
| 1.319999999999909 | 0.115 | 0.094 | 0.088 |
| 1.324999999999909 | 0.115 | 0.094 | 0.088 |
| 1.329999999999909 | 0.115 | 0.094 | 0.088 |
| 1.334999999999909 | 0.115 | 0.094 | 0.088 |
| 1.339999999999909 | 0.115 | 0.094 | 0.088 |
| 1.344999999999909 | 0.116 | 0.094 | 0.088 |
| 1.349999999999909 | 0.116 | 0.094 | 0.088 |
| 1.354999999999909 | 0.116 | 0.094 | 0.088 |
| 1.359999999999909 | 0.116 | 0.094 | 0.088 |
| 1.364999999999908 | 0.116 | 0.094 | 0.088 |
| 1.369999999999908 | 0.116 | 0.094 | 0.088 |
| 1.374999999999908 | 0.116 | 0.094 | 0.088 |
| 1.379999999999908 | 0.116 | 0.094 | 0.088 |
| 1.384999999999908 | 0.116 | 0.094 | 0.088 |
| 1.389999999999908 | 0.116 | 0.094 | 0.088 |
| 1.394999999999908 | 0.116 | 0.093 | 0.088 |
| 1.399999999999908 | 0.116 | 0.093 | 0.088 |
| 1.404999999999908 | 0.116 | 0.093 | 0.088 |
| 1.409999999999908 | 0.116 | 0.093 | 0.088 |
| 1.414999999999907 | 0.116 | 0.093 | 0.088 |
| 1.419999999999907 | 0.117 | 0.093 | 0.088 |
| 1.424999999999907 | 0.117 | 0.093 | 0.088 |
| 1.429999999999907 | 0.117 | 0.093 | 0.087 |
| 1.434999999999907 | 0.117 | 0.093 | 0.087 |
| 1.439999999999907 | 0.117 | 0.093 | 0.087 |
| 1.444999999999907 | 0.117 | 0.093 | 0.087 |
| 1.449999999999907 | 0.117 | 0.093 | 0.087 |
| 1.454999999999907 | 0.117 | 0.093 | 0.087 |
| 1.459999999999906 | 0.117 | 0.093 | 0.087 |
| 1.464999999999906 | 0.117 | 0.093 | 0.087 |
| 1.469999999999906 | 0.117 | 0.093 | 0.087 |
| 1.474999999999906 | 0.117 | 0.093 | 0.087 |
| 1.479999999999906 | 0.117 | 0.093 | 0.087 |
| 1.484999999999906 | 0.117 | 0.093 | 0.087 |
| 1.489999999999906 | 0.118 | 0.093 | 0.087 |
| 1.494999999999906 | 0.118 | 0.093 | 0.087 |
| 1.499999999999906 | 0.118 | 0.093 | 0.087 |
| 1.504999999999906 | 0.118 | 0.093 | 0.087 |
| 1.509999999999905 | 0.118 | 0.093 | 0.087 |
| 1.514999999999905 | 0.118 | 0.093 | 0.087 |
| 1.519999999999905 | 0.118 | 0.093 | 0.087 |
| 1.524999999999905 | 0.118 | 0.093 | 0.087 |
| 1.529999999999905 | 0.118 | 0.093 | 0.087 |
| 1.534999999999905 | 0.118 | 0.093 | 0.087 |
| 1.539999999999905 | 0.118 | 0.093 | 0.087 |
| 1.544999999999905 | 0.118 | 0.093 | 0.087 |
| 1.549999999999905 | 0.118 | 0.093 | 0.087 |
| 1.554999999999904 | 0.118 | 0.093 | 0.087 |
| 1.559999999999904 | 0.118 | 0.093 | 0.087 |
| 1.564999999999904 | 0.119 | 0.093 | 0.086 |
| 1.569999999999904 | 0.119 | 0.093 | 0.086 |
| 1.574999999999904 | 0.119 | 0.093 | 0.086 |
| 1.579999999999904 | 0.119 | 0.093 | 0.086 |
| 1.584999999999904 | 0.119 | 0.093 | 0.086 |
| 1.589999999999904 | 0.119 | 0.093 | 0.086 |
| 1.594999999999904 | 0.119 | 0.093 | 0.086 |
| 1.599999999999903 | 0.119 | 0.093 | 0.086 |
| 1.604999999999903 | 0.119 | 0.093 | 0.086 |
| 1.609999999999903 | 0.119 | 0.093 | 0.086 |
| 1.614999999999903 | 0.119 | 0.093 | 0.086 |
| 1.619999999999903 | 0.119 | 0.093 | 0.086 |
| 1.624999999999903 | 0.119 | 0.092 | 0.086 |
| 1.629999999999903 | 0.119 | 0.092 | 0.086 |
| 1.634999999999903 | 0.12 | 0.092 | 0.086 |
| 1.639999999999903 | 0.12 | 0.092 | 0.086 |
| 1.644999999999902 | 0.12 | 0.092 | 0.086 |
| 1.649999999999902 | 0.12 | 0.092 | 0.086 |
| 1.654999999999902 | 0.12 | 0.092 | 0.086 |
| 1.659999999999902 | 0.12 | 0.092 | 0.086 |
| 1.664999999999902 | 0.12 | 0.092 | 0.086 |
| 1.669999999999902 | 0.12 | 0.092 | 0.086 |
| 1.674999999999902 | 0.12 | 0.092 | 0.086 |
| 1.679999999999902 | 0.12 | 0.092 | 0.086 |
| 1.684999999999902 | 0.12 | 0.092 | 0.086 |
| 1.689999999999901 | 0.12 | 0.092 | 0.086 |
| 1.694999999999901 | 0.12 | 0.092 | 0.086 |
| 1.699999999999901 | 0.12 | 0.092 | 0.085 |
| 1.704999999999901 | 0.121 | 0.092 | 0.085 |
| 1.709999999999901 | 0.121 | 0.092 | 0.085 |
| 1.714999999999901 | 0.121 | 0.092 | 0.085 |
| 1.719999999999901 | 0.121 | 0.092 | 0.085 |
| 1.724999999999901 | 0.121 | 0.092 | 0.085 |
| 1.729999999999901 | 0.121 | 0.092 | 0.085 |
| 1.734999999999901 | 0.121 | 0.092 | 0.085 |
| 1.7399999999999 | 0.121 | 0.092 | 0.085 |
| 1.7449999999999 | 0.121 | 0.092 | 0.085 |
| 1.7499999999999 | 0.121 | 0.092 | 0.085 |
| 1.7549999999999 | 0.121 | 0.092 | 0.085 |
| 1.7599999999999 | 0.121 | 0.092 | 0.085 |
| 1.7649999999999 | 0.121 | 0.092 | 0.085 |
| 1.7699999999999 | 0.122 | 0.092 | 0.085 |
| 1.7749999999999 | 0.122 | 0.092 | 0.085 |
| 1.7799999999999 | 0.122 | 0.092 | 0.085 |
| 1.784999999999899 | 0.122 | 0.092 | 0.085 |
| 1.789999999999899 | 0.122 | 0.092 | 0.085 |
| 1.794999999999899 | 0.122 | 0.092 | 0.085 |
| 1.799999999999899 | 0.122 | 0.092 | 0.085 |
| 1.804999999999899 | 0.122 | 0.092 | 0.085 |
| 1.809999999999899 | 0.122 | 0.092 | 0.085 |
| 1.814999999999899 | 0.122 | 0.092 | 0.085 |
| 1.819999999999899 | 0.122 | 0.092 | 0.085 |
| 1.824999999999899 | 0.122 | 0.092 | 0.085 |
| 1.829999999999899 | 0.122 | 0.092 | 0.085 |
| 1.834999999999898 | 0.122 | 0.092 | 0.084 |
| 1.839999999999898 | 0.123 | 0.092 | 0.084 |
| 1.844999999999898 | 0.123 | 0.092 | 0.084 |
| 1.849999999999898 | 0.123 | 0.092 | 0.084 |
| 1.854999999999898 | 0.123 | 0.092 | 0.084 |
| 1.859999999999898 | 0.123 | 0.091 | 0.084 |
| 1.864999999999898 | 0.123 | 0.091 | 0.084 |
| 1.869999999999898 | 0.123 | 0.091 | 0.084 |
| 1.874999999999898 | 0.123 | 0.091 | 0.084 |
| 1.879999999999897 | 0.123 | 0.091 | 0.084 |
| 1.884999999999897 | 0.123 | 0.091 | 0.084 |
| 1.889999999999897 | 0.123 | 0.091 | 0.084 |
| 1.894999999999897 | 0.123 | 0.091 | 0.084 |
| 1.899999999999897 | 0.123 | 0.091 | 0.084 |
| 1.904999999999897 | 0.124 | 0.091 | 0.084 |
| 1.909999999999897 | 0.124 | 0.091 | 0.084 |
| 1.914999999999897 | 0.124 | 0.091 | 0.084 |
| 1.919999999999897 | 0.124 | 0.091 | 0.084 |
| 1.924999999999897 | 0.124 | 0.091 | 0.084 |
| 1.929999999999896 | 0.124 | 0.091 | 0.084 |
| 1.934999999999896 | 0.124 | 0.091 | 0.084 |
| 1.939999999999896 | 0.124 | 0.091 | 0.084 |
| 1.944999999999896 | 0.124 | 0.091 | 0.084 |
| 1.949999999999896 | 0.124 | 0.091 | 0.084 |
| 1.954999999999896 | 0.124 | 0.091 | 0.084 |
| 1.959999999999896 | 0.124 | 0.091 | 0.084 |
| 1.964999999999896 | 0.124 | 0.091 | 0.084 |
| 1.969999999999896 | 0.125 | 0.091 | 0.084 |
| 1.974999999999895 | 0.125 | 0.091 | 0.084 |
| 1.979999999999895 | 0.125 | 0.091 | 0.083 |
| 1.984999999999895 | 0.125 | 0.091 | 0.083 |
| 1.989999999999895 | 0.125 | 0.091 | 0.083 |
| 1.994999999999895 | 0.125 | 0.091 | 0.083 |
| 1.999999999999895 | 0.125 | 0.091 | 0.083 |
| 2.004999999999895 | 0.125 | 0.091 | 0.083 |
| 2.009999999999895 | 0.125 | 0.091 | 0.083 |
| 2.014999999999895 | 0.125 | 0.091 | 0.083 |
| 2.019999999999895 | 0.125 | 0.091 | 0.083 |
| 2.024999999999895 | 0.125 | 0.091 | 0.083 |
| 2.029999999999895 | 0.125 | 0.091 | 0.083 |
| 2.034999999999894 | 0.126 | 0.091 | 0.083 |
| 2.039999999999894 | 0.126 | 0.091 | 0.083 |
| 2.044999999999894 | 0.126 | 0.091 | 0.083 |
| 2.049999999999894 | 0.126 | 0.091 | 0.083 |
| 2.054999999999894 | 0.126 | 0.091 | 0.083 |
| 2.059999999999894 | 0.126 | 0.091 | 0.083 |
| 2.064999999999894 | 0.126 | 0.091 | 0.083 |
| 2.069999999999894 | 0.126 | 0.091 | 0.083 |
| 2.074999999999894 | 0.126 | 0.091 | 0.083 |
| 2.079999999999893 | 0.126 | 0.091 | 0.083 |
| 2.084999999999893 | 0.126 | 0.091 | 0.083 |
| 2.089999999999893 | 0.126 | 0.091 | 0.083 |
| 2.094999999999893 | 0.127 | 0.091 | 0.083 |
| 2.099999999999893 | 0.127 | 0.09 | 0.083 |
| 2.104999999999893 | 0.127 | 0.09 | 0.083 |
| 2.109999999999893 | 0.127 | 0.09 | 0.083 |
| 2.114999999999893 | 0.127 | 0.09 | 0.083 |
| 2.119999999999893 | 0.127 | 0.09 | 0.083 |
| 2.124999999999893 | 0.127 | 0.09 | 0.082 |
| 2.129999999999892 | 0.127 | 0.09 | 0.082 |
| 2.134999999999892 | 0.127 | 0.09 | 0.082 |
| 2.139999999999892 | 0.127 | 0.09 | 0.082 |
| 2.144999999999892 | 0.127 | 0.09 | 0.082 |
| 2.149999999999892 | 0.127 | 0.09 | 0.082 |
| 2.154999999999892 | 0.127 | 0.09 | 0.082 |
| 2.159999999999892 | 0.128 | 0.09 | 0.082 |
| 2.164999999999892 | 0.128 | 0.09 | 0.082 |
| 2.169999999999892 | 0.128 | 0.09 | 0.082 |
| 2.174999999999891 | 0.128 | 0.09 | 0.082 |
| 2.179999999999891 | 0.128 | 0.09 | 0.082 |
| 2.184999999999891 | 0.128 | 0.09 | 0.082 |
| 2.189999999999891 | 0.128 | 0.09 | 0.082 |
| 2.194999999999891 | 0.128 | 0.09 | 0.082 |
| 2.199999999999891 | 0.128 | 0.09 | 0.082 |
| 2.204999999999891 | 0.128 | 0.09 | 0.082 |
| 2.209999999999891 | 0.128 | 0.09 | 0.082 |
| 2.214999999999891 | 0.128 | 0.09 | 0.082 |
| 2.21999999999989 | 0.129 | 0.09 | 0.082 |
| 2.22499999999989 | 0.129 | 0.09 | 0.082 |
| 2.22999999999989 | 0.129 | 0.09 | 0.082 |
| 2.23499999999989 | 0.129 | 0.09 | 0.082 |
| 2.23999999999989 | 0.129 | 0.09 | 0.082 |
| 2.24499999999989 | 0.129 | 0.09 | 0.082 |
| 2.24999999999989 | 0.129 | 0.09 | 0.082 |
| 2.25499999999989 | 0.129 | 0.09 | 0.082 |
| 2.25999999999989 | 0.129 | 0.09 | 0.082 |
| 2.26499999999989 | 0.129 | 0.09 | 0.082 |
| 2.269999999999889 | 0.129 | 0.09 | 0.081 |
| 2.274999999999889 | 0.129 | 0.09 | 0.081 |
| 2.279999999999889 | 0.13 | 0.09 | 0.081 |
| 2.284999999999889 | 0.13 | 0.09 | 0.081 |
| 2.289999999999889 | 0.13 | 0.09 | 0.081 |
| 2.294999999999889 | 0.13 | 0.09 | 0.081 |
| 2.299999999999889 | 0.13 | 0.09 | 0.081 |
| 2.304999999999889 | 0.13 | 0.09 | 0.081 |
| 2.309999999999889 | 0.13 | 0.09 | 0.081 |
| 2.314999999999888 | 0.13 | 0.09 | 0.081 |
| 2.319999999999888 | 0.13 | 0.09 | 0.081 |
| 2.324999999999888 | 0.13 | 0.09 | 0.081 |
| 2.329999999999888 | 0.13 | 0.09 | 0.081 |
| 2.334999999999888 | 0.13 | 0.09 | 0.081 |
| 2.339999999999888 | 0.131 | 0.09 | 0.081 |
| 2.344999999999888 | 0.131 | 0.09 | 0.081 |
| 2.349999999999888 | 0.131 | 0.089 | 0.081 |
| 2.354999999999888 | 0.131 | 0.089 | 0.081 |
| 2.359999999999887 | 0.131 | 0.089 | 0.081 |
| 2.364999999999887 | 0.131 | 0.089 | 0.081 |
| 2.369999999999887 | 0.131 | 0.089 | 0.081 |
| 2.374999999999887 | 0.131 | 0.089 | 0.081 |
| 2.379999999999887 | 0.131 | 0.089 | 0.081 |
| 2.384999999999887 | 0.131 | 0.089 | 0.081 |
| 2.389999999999887 | 0.131 | 0.089 | 0.081 |
| 2.394999999999887 | 0.131 | 0.089 | 0.081 |
| 2.399999999999887 | 0.132 | 0.089 | 0.081 |
| 2.404999999999887 | 0.132 | 0.089 | 0.081 |
| 2.409999999999886 | 0.132 | 0.089 | 0.081 |
| 2.414999999999886 | 0.132 | 0.089 | 0.081 |
| 2.419999999999886 | 0.132 | 0.089 | 0.081 |
| 2.424999999999886 | 0.132 | 0.089 | 0.08 |
| 2.429999999999886 | 0.132 | 0.089 | 0.08 |
| 2.434999999999886 | 0.132 | 0.089 | 0.08 |
| 2.439999999999886 | 0.132 | 0.089 | 0.08 |
| 2.444999999999886 | 0.132 | 0.089 | 0.08 |
| 2.449999999999886 | 0.132 | 0.089 | 0.08 |
| 2.454999999999885 | 0.133 | 0.089 | 0.08 |
| 2.459999999999885 | 0.133 | 0.089 | 0.08 |
| 2.464999999999885 | 0.133 | 0.089 | 0.08 |
| 2.469999999999885 | 0.133 | 0.089 | 0.08 |
| 2.474999999999885 | 0.133 | 0.089 | 0.08 |
| 2.479999999999885 | 0.133 | 0.089 | 0.08 |
| 2.484999999999885 | 0.133 | 0.089 | 0.08 |
| 2.489999999999885 | 0.133 | 0.089 | 0.08 |
| 2.494999999999885 | 0.133 | 0.089 | 0.08 |
| 2.499999999999884 | 0.133 | 0.089 | 0.08 |
| 2.504999999999884 | 0.133 | 0.089 | 0.08 |
| 2.509999999999884 | 0.134 | 0.089 | 0.08 |
| 2.514999999999884 | 0.134 | 0.089 | 0.08 |
| 2.519999999999884 | 0.134 | 0.089 | 0.08 |
| 2.524999999999884 | 0.134 | 0.089 | 0.08 |
| 2.529999999999884 | 0.134 | 0.089 | 0.08 |
| 2.534999999999884 | 0.134 | 0.089 | 0.08 |
| 2.539999999999884 | 0.134 | 0.089 | 0.08 |
| 2.544999999999884 | 0.134 | 0.089 | 0.08 |
| 2.549999999999883 | 0.134 | 0.089 | 0.08 |
| 2.554999999999883 | 0.134 | 0.089 | 0.08 |
| 2.559999999999883 | 0.134 | 0.089 | 0.08 |
| 2.564999999999883 | 0.134 | 0.089 | 0.08 |
| 2.569999999999883 | 0.135 | 0.089 | 0.08 |
| 2.574999999999883 | 0.135 | 0.089 | 0.08 |
| 2.579999999999883 | 0.135 | 0.089 | 0.079 |
| 2.584999999999883 | 0.135 | 0.089 | 0.079 |
| 2.589999999999883 | 0.135 | 0.089 | 0.079 |
| 2.594999999999882 | 0.135 | 0.089 | 0.079 |
| 2.599999999999882 | 0.135 | 0.088 | 0.079 |
| 2.604999999999882 | 0.135 | 0.088 | 0.079 |
| 2.609999999999882 | 0.135 | 0.088 | 0.079 |
| 2.614999999999882 | 0.135 | 0.088 | 0.079 |
| 2.619999999999882 | 0.136 | 0.088 | 0.079 |
| 2.624999999999882 | 0.136 | 0.088 | 0.079 |
| 2.629999999999882 | 0.136 | 0.088 | 0.079 |
| 2.634999999999882 | 0.136 | 0.088 | 0.079 |
| 2.639999999999881 | 0.136 | 0.088 | 0.079 |
| 2.644999999999881 | 0.136 | 0.088 | 0.079 |
| 2.649999999999881 | 0.136 | 0.088 | 0.079 |
| 2.654999999999881 | 0.136 | 0.088 | 0.079 |
| 2.659999999999881 | 0.136 | 0.088 | 0.079 |
| 2.664999999999881 | 0.136 | 0.088 | 0.079 |
| 2.669999999999881 | 0.136 | 0.088 | 0.079 |
| 2.674999999999881 | 0.137 | 0.088 | 0.079 |
| 2.679999999999881 | 0.137 | 0.088 | 0.079 |
| 2.68499999999988 | 0.137 | 0.088 | 0.079 |
| 2.68999999999988 | 0.137 | 0.088 | 0.079 |
| 2.69499999999988 | 0.137 | 0.088 | 0.079 |
| 2.69999999999988 | 0.137 | 0.088 | 0.079 |
| 2.70499999999988 | 0.137 | 0.088 | 0.079 |
| 2.70999999999988 | 0.137 | 0.088 | 0.079 |
| 2.71499999999988 | 0.137 | 0.088 | 0.079 |
| 2.71999999999988 | 0.137 | 0.088 | 0.079 |
| 2.72499999999988 | 0.137 | 0.088 | 0.079 |
| 2.72999999999988 | 0.138 | 0.088 | 0.079 |
| 2.734999999999879 | 0.138 | 0.088 | 0.079 |
| 2.739999999999879 | 0.138 | 0.088 | 0.078 |
| 2.744999999999879 | 0.138 | 0.088 | 0.078 |
| 2.749999999999879 | 0.138 | 0.088 | 0.078 |
| 2.754999999999879 | 0.138 | 0.088 | 0.078 |
| 2.759999999999879 | 0.138 | 0.088 | 0.078 |
| 2.764999999999879 | 0.138 | 0.088 | 0.078 |
| 2.769999999999879 | 0.138 | 0.088 | 0.078 |
| 2.774999999999879 | 0.138 | 0.088 | 0.078 |
| 2.779999999999878 | 0.139 | 0.088 | 0.078 |
| 2.784999999999878 | 0.139 | 0.088 | 0.078 |
| 2.789999999999878 | 0.139 | 0.088 | 0.078 |
| 2.794999999999878 | 0.139 | 0.088 | 0.078 |
| 2.799999999999878 | 0.139 | 0.088 | 0.078 |
| 2.804999999999878 | 0.139 | 0.088 | 0.078 |
| 2.809999999999878 | 0.139 | 0.088 | 0.078 |
| 2.814999999999878 | 0.139 | 0.088 | 0.078 |
| 2.819999999999878 | 0.139 | 0.088 | 0.078 |
| 2.824999999999878 | 0.139 | 0.088 | 0.078 |
| 2.829999999999877 | 0.139 | 0.088 | 0.078 |
| 2.834999999999877 | 0.14 | 0.088 | 0.078 |
| 2.839999999999877 | 0.14 | 0.088 | 0.078 |
| 2.844999999999877 | 0.14 | 0.088 | 0.078 |
| 2.849999999999877 | 0.14 | 0.088 | 0.078 |
| 2.854999999999877 | 0.14 | 0.088 | 0.078 |
| 2.859999999999877 | 0.14 | 0.087 | 0.078 |
| 2.864999999999877 | 0.14 | 0.087 | 0.078 |
| 2.869999999999877 | 0.14 | 0.087 | 0.078 |
| 2.874999999999876 | 0.14 | 0.087 | 0.078 |
| 2.879999999999876 | 0.14 | 0.087 | 0.078 |
| 2.884999999999876 | 0.141 | 0.087 | 0.078 |
| 2.889999999999876 | 0.141 | 0.087 | 0.078 |
| 2.894999999999876 | 0.141 | 0.087 | 0.078 |
| 2.899999999999876 | 0.141 | 0.087 | 0.078 |
| 2.904999999999876 | 0.141 | 0.087 | 0.077 |
| 2.909999999999876 | 0.141 | 0.087 | 0.077 |
| 2.914999999999876 | 0.141 | 0.087 | 0.077 |
| 2.919999999999876 | 0.141 | 0.087 | 0.077 |
| 2.924999999999875 | 0.141 | 0.087 | 0.077 |
| 2.929999999999875 | 0.141 | 0.087 | 0.077 |
| 2.934999999999875 | 0.142 | 0.087 | 0.077 |
| 2.939999999999875 | 0.142 | 0.087 | 0.077 |
| 2.944999999999875 | 0.142 | 0.087 | 0.077 |
| 2.949999999999875 | 0.142 | 0.087 | 0.077 |
| 2.954999999999875 | 0.142 | 0.087 | 0.077 |
| 2.959999999999875 | 0.142 | 0.087 | 0.077 |
| 2.964999999999875 | 0.142 | 0.087 | 0.077 |
| 2.969999999999874 | 0.142 | 0.087 | 0.077 |
| 2.974999999999874 | 0.142 | 0.087 | 0.077 |
| 2.979999999999874 | 0.142 | 0.087 | 0.077 |
| 2.984999999999874 | 0.143 | 0.087 | 0.077 |
| 2.989999999999874 | 0.143 | 0.087 | 0.077 |
| 2.994999999999874 | 0.143 | 0.087 | 0.077 |
| 2.999999999999874 | 0.143 | 0.087 | 0.077 |
| 3.004999999999874 | 0.143 | 0.087 | 0.077 |
| 3.009999999999874 | 0.143 | 0.087 | 0.077 |
| 3.014999999999874 | 0.143 | 0.087 | 0.077 |
| 3.019999999999873 | 0.143 | 0.087 | 0.077 |
| 3.024999999999873 | 0.143 | 0.087 | 0.077 |
| 3.029999999999873 | 0.143 | 0.087 | 0.077 |
| 3.034999999999873 | 0.144 | 0.087 | 0.077 |
| 3.039999999999873 | 0.144 | 0.087 | 0.077 |
| 3.044999999999873 | 0.144 | 0.087 | 0.077 |
| 3.049999999999873 | 0.144 | 0.087 | 0.077 |
| 3.054999999999873 | 0.144 | 0.087 | 0.077 |
| 3.059999999999873 | 0.144 | 0.087 | 0.077 |
| 3.064999999999872 | 0.144 | 0.087 | 0.077 |
| 3.069999999999872 | 0.144 | 0.087 | 0.077 |
| 3.074999999999872 | 0.144 | 0.087 | 0.076 |
| 3.079999999999872 | 0.145 | 0.087 | 0.076 |
| 3.084999999999872 | 0.145 | 0.087 | 0.076 |
| 3.089999999999872 | 0.145 | 0.087 | 0.076 |
| 3.094999999999872 | 0.145 | 0.087 | 0.076 |
| 3.099999999999872 | 0.145 | 0.087 | 0.076 |
| 3.104999999999872 | 0.145 | 0.087 | 0.076 |
| 3.109999999999872 | 0.145 | 0.087 | 0.076 |
| 3.114999999999871 | 0.145 | 0.087 | 0.076 |
| 3.119999999999871 | 0.145 | 0.087 | 0.076 |
| 3.124999999999871 | 0.145 | 0.086 | 0.076 |
| 3.129999999999871 | 0.146 | 0.086 | 0.076 |
| 3.134999999999871 | 0.146 | 0.086 | 0.076 |
| 3.139999999999871 | 0.146 | 0.086 | 0.076 |
| 3.144999999999871 | 0.146 | 0.086 | 0.076 |
| 3.149999999999871 | 0.146 | 0.086 | 0.076 |
| 3.154999999999871 | 0.146 | 0.086 | 0.076 |
| 3.15999999999987 | 0.146 | 0.086 | 0.076 |
| 3.16499999999987 | 0.146 | 0.086 | 0.076 |
| 3.16999999999987 | 0.146 | 0.086 | 0.076 |
| 3.17499999999987 | 0.147 | 0.086 | 0.076 |
| 3.17999999999987 | 0.147 | 0.086 | 0.076 |
| 3.18499999999987 | 0.147 | 0.086 | 0.076 |
| 3.18999999999987 | 0.147 | 0.086 | 0.076 |
| 3.19499999999987 | 0.147 | 0.086 | 0.076 |
| 3.19999999999987 | 0.147 | 0.086 | 0.076 |
| 3.204999999999869 | 0.147 | 0.086 | 0.076 |
| 3.209999999999869 | 0.147 | 0.086 | 0.076 |
| 3.214999999999869 | 0.147 | 0.086 | 0.076 |
| 3.219999999999869 | 0.147 | 0.086 | 0.076 |
| 3.224999999999869 | 0.148 | 0.086 | 0.076 |
| 3.229999999999869 | 0.148 | 0.086 | 0.076 |
| 3.234999999999869 | 0.148 | 0.086 | 0.076 |
| 3.239999999999869 | 0.148 | 0.086 | 0.076 |
| 3.244999999999869 | 0.148 | 0.086 | 0.076 |
| 3.249999999999869 | 0.148 | 0.086 | 0.075 |
| 3.254999999999868 | 0.148 | 0.086 | 0.075 |
| 3.259999999999868 | 0.148 | 0.086 | 0.075 |
| 3.264999999999868 | 0.148 | 0.086 | 0.075 |
| 3.269999999999868 | 0.149 | 0.086 | 0.075 |
| 3.274999999999868 | 0.149 | 0.086 | 0.075 |
| 3.279999999999868 | 0.149 | 0.086 | 0.075 |
| 3.284999999999868 | 0.149 | 0.086 | 0.075 |
| 3.289999999999868 | 0.149 | 0.086 | 0.075 |
| 3.294999999999868 | 0.149 | 0.086 | 0.075 |
| 3.299999999999867 | 0.149 | 0.086 | 0.075 |
| 3.304999999999867 | 0.149 | 0.086 | 0.075 |
| 3.309999999999867 | 0.149 | 0.086 | 0.075 |
| 3.314999999999867 | 0.15 | 0.086 | 0.075 |
| 3.319999999999867 | 0.15 | 0.086 | 0.075 |
| 3.324999999999867 | 0.15 | 0.086 | 0.075 |
| 3.329999999999867 | 0.15 | 0.086 | 0.075 |
| 3.334999999999867 | 0.15 | 0.086 | 0.075 |
| 3.339999999999867 | 0.15 | 0.086 | 0.075 |
| 3.344999999999866 | 0.15 | 0.086 | 0.075 |
| 3.349999999999866 | 0.15 | 0.086 | 0.075 |
| 3.354999999999866 | 0.15 | 0.086 | 0.075 |
| 3.359999999999866 | 0.151 | 0.086 | 0.075 |
| 3.364999999999866 | 0.151 | 0.086 | 0.075 |
| 3.369999999999866 | 0.151 | 0.086 | 0.075 |
| 3.374999999999866 | 0.151 | 0.086 | 0.075 |
| 3.379999999999866 | 0.151 | 0.086 | 0.075 |
| 3.384999999999866 | 0.151 | 0.086 | 0.075 |
| 3.389999999999866 | 0.151 | 0.086 | 0.075 |
| 3.394999999999865 | 0.151 | 0.085 | 0.075 |
| 3.399999999999865 | 0.152 | 0.085 | 0.075 |
| 3.404999999999865 | 0.152 | 0.085 | 0.075 |
| 3.409999999999865 | 0.152 | 0.085 | 0.075 |
| 3.414999999999865 | 0.152 | 0.085 | 0.075 |
| 3.419999999999865 | 0.152 | 0.085 | 0.075 |
| 3.424999999999865 | 0.152 | 0.085 | 0.074 |
| 3.429999999999865 | 0.152 | 0.085 | 0.074 |
| 3.434999999999865 | 0.152 | 0.085 | 0.074 |
| 3.439999999999864 | 0.152 | 0.085 | 0.074 |
| 3.444999999999864 | 0.153 | 0.085 | 0.074 |
| 3.449999999999864 | 0.153 | 0.085 | 0.074 |
| 3.454999999999864 | 0.153 | 0.085 | 0.074 |
| 3.459999999999864 | 0.153 | 0.085 | 0.074 |
| 3.464999999999864 | 0.153 | 0.085 | 0.074 |
| 3.469999999999864 | 0.153 | 0.085 | 0.074 |
| 3.474999999999864 | 0.153 | 0.085 | 0.074 |
| 3.479999999999864 | 0.153 | 0.085 | 0.074 |
| 3.484999999999864 | 0.153 | 0.085 | 0.074 |
| 3.489999999999863 | 0.154 | 0.085 | 0.074 |
| 3.494999999999863 | 0.154 | 0.085 | 0.074 |
| 3.499999999999863 | 0.154 | 0.085 | 0.074 |
| 3.504999999999863 | 0.154 | 0.085 | 0.074 |
| 3.509999999999863 | 0.154 | 0.085 | 0.074 |
| 3.514999999999863 | 0.154 | 0.085 | 0.074 |
| 3.519999999999863 | 0.154 | 0.085 | 0.074 |
| 3.524999999999863 | 0.154 | 0.085 | 0.074 |
| 3.529999999999863 | 0.155 | 0.085 | 0.074 |
| 3.534999999999862 | 0.155 | 0.085 | 0.074 |
| 3.539999999999862 | 0.155 | 0.085 | 0.074 |
| 3.544999999999862 | 0.155 | 0.085 | 0.074 |
| 3.549999999999862 | 0.155 | 0.085 | 0.074 |
| 3.554999999999862 | 0.155 | 0.085 | 0.074 |
| 3.559999999999862 | 0.155 | 0.085 | 0.074 |
| 3.564999999999862 | 0.155 | 0.085 | 0.074 |
| 3.569999999999862 | 0.156 | 0.085 | 0.074 |
| 3.574999999999862 | 0.156 | 0.085 | 0.074 |
| 3.579999999999862 | 0.156 | 0.085 | 0.074 |
| 3.584999999999861 | 0.156 | 0.085 | 0.074 |
| 3.589999999999861 | 0.156 | 0.085 | 0.074 |
| 3.594999999999861 | 0.156 | 0.085 | 0.074 |
| 3.599999999999861 | 0.156 | 0.085 | 0.074 |
| 3.604999999999861 | 0.156 | 0.085 | 0.074 |
| 3.609999999999861 | 0.156 | 0.085 | 0.073 |
| 3.614999999999861 | 0.157 | 0.085 | 0.073 |
| 3.619999999999861 | 0.157 | 0.085 | 0.073 |
| 3.62499999999986 | 0.157 | 0.085 | 0.073 |
| 3.62999999999986 | 0.157 | 0.085 | 0.073 |
| 3.63499999999986 | 0.157 | 0.085 | 0.073 |
| 3.63999999999986 | 0.157 | 0.085 | 0.073 |
| 3.64499999999986 | 0.157 | 0.085 | 0.073 |
| 3.64999999999986 | 0.157 | 0.085 | 0.073 |
| 3.65499999999986 | 0.158 | 0.085 | 0.073 |
| 3.65999999999986 | 0.158 | 0.085 | 0.073 |
| 3.66499999999986 | 0.158 | 0.085 | 0.073 |
| 3.669999999999859 | 0.158 | 0.084 | 0.073 |
| 3.674999999999859 | 0.158 | 0.084 | 0.073 |
| 3.679999999999859 | 0.158 | 0.084 | 0.073 |
| 3.684999999999859 | 0.158 | 0.084 | 0.073 |
| 3.689999999999859 | 0.158 | 0.084 | 0.073 |
| 3.694999999999859 | 0.159 | 0.084 | 0.073 |
| 3.699999999999859 | 0.159 | 0.084 | 0.073 |
| 3.704999999999859 | 0.159 | 0.084 | 0.073 |
| 3.709999999999859 | 0.159 | 0.084 | 0.073 |
| 3.714999999999859 | 0.159 | 0.084 | 0.073 |
| 3.719999999999858 | 0.159 | 0.084 | 0.073 |
| 3.724999999999858 | 0.159 | 0.084 | 0.073 |
| 3.729999999999858 | 0.159 | 0.084 | 0.073 |
| 3.734999999999858 | 0.16 | 0.084 | 0.073 |
| 3.739999999999858 | 0.16 | 0.084 | 0.073 |
| 3.744999999999858 | 0.16 | 0.084 | 0.073 |
| 3.749999999999858 | 0.16 | 0.084 | 0.073 |
| 3.754999999999858 | 0.16 | 0.084 | 0.073 |
| 3.759999999999858 | 0.16 | 0.084 | 0.073 |
| 3.764999999999857 | 0.16 | 0.084 | 0.073 |
| 3.769999999999857 | 0.161 | 0.084 | 0.073 |
| 3.774999999999857 | 0.161 | 0.084 | 0.073 |
| 3.779999999999857 | 0.161 | 0.084 | 0.073 |
| 3.784999999999857 | 0.161 | 0.084 | 0.073 |
| 3.789999999999857 | 0.161 | 0.084 | 0.073 |
| 3.794999999999857 | 0.161 | 0.084 | 0.072 |
| 3.799999999999857 | 0.161 | 0.084 | 0.072 |
| 3.804999999999857 | 0.161 | 0.084 | 0.072 |
| 3.809999999999857 | 0.162 | 0.084 | 0.072 |
| 3.814999999999856 | 0.162 | 0.084 | 0.072 |
| 3.819999999999856 | 0.162 | 0.084 | 0.072 |
| 3.824999999999856 | 0.162 | 0.084 | 0.072 |
| 3.829999999999856 | 0.162 | 0.084 | 0.072 |
| 3.834999999999856 | 0.162 | 0.084 | 0.072 |
| 3.839999999999856 | 0.162 | 0.084 | 0.072 |
| 3.844999999999856 | 0.162 | 0.084 | 0.072 |
| 3.849999999999856 | 0.163 | 0.084 | 0.072 |
| 3.854999999999856 | 0.163 | 0.084 | 0.072 |
| 3.859999999999855 | 0.163 | 0.084 | 0.072 |
| 3.864999999999855 | 0.163 | 0.084 | 0.072 |
| 3.869999999999855 | 0.163 | 0.084 | 0.072 |
| 3.874999999999855 | 0.163 | 0.084 | 0.072 |
| 3.879999999999855 | 0.163 | 0.084 | 0.072 |
| 3.884999999999855 | 0.164 | 0.084 | 0.072 |
| 3.889999999999855 | 0.164 | 0.084 | 0.072 |
| 3.894999999999855 | 0.164 | 0.084 | 0.072 |
| 3.899999999999855 | 0.164 | 0.084 | 0.072 |
| 3.904999999999855 | 0.164 | 0.084 | 0.072 |
| 3.909999999999854 | 0.164 | 0.084 | 0.072 |
| 3.914999999999854 | 0.164 | 0.084 | 0.072 |
| 3.919999999999854 | 0.164 | 0.084 | 0.072 |
| 3.924999999999854 | 0.165 | 0.084 | 0.072 |
| 3.929999999999854 | 0.165 | 0.084 | 0.072 |
| 3.934999999999854 | 0.165 | 0.084 | 0.072 |
| 3.939999999999854 | 0.165 | 0.084 | 0.072 |
| 3.944999999999854 | 0.165 | 0.084 | 0.072 |
| 3.949999999999854 | 0.165 | 0.084 | 0.072 |
| 3.954999999999853 | 0.165 | 0.083 | 0.072 |
| 3.959999999999853 | 0.166 | 0.083 | 0.072 |
| 3.964999999999853 | 0.166 | 0.083 | 0.072 |
| 3.969999999999853 | 0.166 | 0.083 | 0.072 |
| 3.974999999999853 | 0.166 | 0.083 | 0.072 |
| 3.979999999999853 | 0.166 | 0.083 | 0.072 |
| 3.984999999999853 | 0.166 | 0.083 | 0.072 |
| 3.989999999999853 | 0.166 | 0.083 | 0.071 |
| 3.994999999999853 | 0.167 | 0.083 | 0.071 |
| 3.999999999999853 | 0.167 | 0.083 | 0.071 |
| 4.004999999999852 | 0.167 | 0.083 | 0.071 |
| 4.009999999999852 | 0.167 | 0.083 | 0.071 |
| 4.014999999999852 | 0.167 | 0.083 | 0.071 |
| 4.019999999999852 | 0.167 | 0.083 | 0.071 |
| 4.024999999999852 | 0.167 | 0.083 | 0.071 |
| 4.029999999999852 | 0.168 | 0.083 | 0.071 |
| 4.034999999999852 | 0.168 | 0.083 | 0.071 |
| 4.039999999999851 | 0.168 | 0.083 | 0.071 |
| 4.044999999999852 | 0.168 | 0.083 | 0.071 |
| 4.049999999999851 | 0.168 | 0.083 | 0.071 |
| 4.054999999999851 | 0.168 | 0.083 | 0.071 |
| 4.059999999999851 | 0.168 | 0.083 | 0.071 |
| 4.064999999999851 | 0.168 | 0.083 | 0.071 |
| 4.069999999999851 | 0.169 | 0.083 | 0.071 |
| 4.074999999999851 | 0.169 | 0.083 | 0.071 |
| 4.07999999999985 | 0.169 | 0.083 | 0.071 |
| 4.084999999999851 | 0.169 | 0.083 | 0.071 |
| 4.08999999999985 | 0.169 | 0.083 | 0.071 |
| 4.094999999999851 | 0.169 | 0.083 | 0.071 |
| 4.09999999999985 | 0.169 | 0.083 | 0.071 |
| 4.10499999999985 | 0.17 | 0.083 | 0.071 |
| 4.10999999999985 | 0.17 | 0.083 | 0.071 |
| 4.11499999999985 | 0.17 | 0.083 | 0.071 |
| 4.11999999999985 | 0.17 | 0.083 | 0.071 |
| 4.12499999999985 | 0.17 | 0.083 | 0.071 |
| 4.12999999999985 | 0.17 | 0.083 | 0.071 |
| 4.13499999999985 | 0.171 | 0.083 | 0.071 |
| 4.13999999999985 | 0.171 | 0.083 | 0.071 |
| 4.144999999999849 | 0.171 | 0.083 | 0.071 |
| 4.14999999999985 | 0.171 | 0.083 | 0.071 |
| 4.154999999999849 | 0.171 | 0.083 | 0.071 |
| 4.15999999999985 | 0.171 | 0.083 | 0.071 |
| 4.164999999999849 | 0.171 | 0.083 | 0.071 |
| 4.169999999999849 | 0.172 | 0.083 | 0.071 |
| 4.174999999999849 | 0.172 | 0.083 | 0.071 |
| 4.179999999999848 | 0.172 | 0.083 | 0.071 |
| 4.184999999999849 | 0.172 | 0.083 | 0.07 |
| 4.189999999999848 | 0.172 | 0.083 | 0.07 |
| 4.194999999999848 | 0.172 | 0.083 | 0.07 |
| 4.199999999999848 | 0.172 | 0.083 | 0.07 |
| 4.204999999999848 | 0.173 | 0.083 | 0.07 |
| 4.209999999999848 | 0.173 | 0.083 | 0.07 |
| 4.214999999999848 | 0.173 | 0.083 | 0.07 |
| 4.219999999999847 | 0.173 | 0.083 | 0.07 |
| 4.224999999999848 | 0.173 | 0.083 | 0.07 |
| 4.229999999999847 | 0.173 | 0.083 | 0.07 |
| 4.234999999999847 | 0.173 | 0.083 | 0.07 |
| 4.239999999999847 | 0.174 | 0.083 | 0.07 |
| 4.244999999999847 | 0.174 | 0.082 | 0.07 |
| 4.249999999999847 | 0.174 | 0.082 | 0.07 |
| 4.254999999999847 | 0.174 | 0.082 | 0.07 |
| 4.259999999999846 | 0.174 | 0.082 | 0.07 |
| 4.264999999999847 | 0.174 | 0.082 | 0.07 |
| 4.269999999999846 | 0.175 | 0.082 | 0.07 |
| 4.274999999999846 | 0.175 | 0.082 | 0.07 |
| 4.279999999999846 | 0.175 | 0.082 | 0.07 |
| 4.284999999999846 | 0.175 | 0.082 | 0.07 |
| 4.289999999999846 | 0.175 | 0.082 | 0.07 |
| 4.294999999999846 | 0.175 | 0.082 | 0.07 |
| 4.299999999999846 | 0.175 | 0.082 | 0.07 |
| 4.304999999999846 | 0.176 | 0.082 | 0.07 |
| 4.309999999999845 | 0.176 | 0.082 | 0.07 |
| 4.314999999999846 | 0.176 | 0.082 | 0.07 |
| 4.319999999999845 | 0.176 | 0.082 | 0.07 |
| 4.324999999999846 | 0.176 | 0.082 | 0.07 |
| 4.329999999999845 | 0.176 | 0.082 | 0.07 |
| 4.334999999999845 | 0.177 | 0.082 | 0.07 |
| 4.339999999999845 | 0.177 | 0.082 | 0.07 |
| 4.344999999999845 | 0.177 | 0.082 | 0.07 |
| 4.349999999999845 | 0.177 | 0.082 | 0.07 |
| 4.354999999999845 | 0.177 | 0.082 | 0.07 |
| 4.359999999999844 | 0.177 | 0.082 | 0.07 |
| 4.364999999999845 | 0.177 | 0.082 | 0.07 |
| 4.369999999999844 | 0.178 | 0.082 | 0.07 |
| 4.374999999999844 | 0.178 | 0.082 | 0.07 |
| 4.379999999999844 | 0.178 | 0.082 | 0.07 |
| 4.384999999999844 | 0.178 | 0.082 | 0.07 |
| 4.389999999999844 | 0.178 | 0.082 | 0.069 |
| 4.394999999999844 | 0.178 | 0.082 | 0.069 |
| 4.399999999999844 | 0.179 | 0.082 | 0.069 |
| 4.404999999999844 | 0.179 | 0.082 | 0.069 |
| 4.409999999999843 | 0.179 | 0.082 | 0.069 |
| 4.414999999999844 | 0.179 | 0.082 | 0.069 |
| 4.419999999999843 | 0.179 | 0.082 | 0.069 |
| 4.424999999999843 | 0.179 | 0.082 | 0.069 |
| 4.429999999999843 | 0.18 | 0.082 | 0.069 |
| 4.434999999999843 | 0.18 | 0.082 | 0.069 |
| 4.439999999999843 | 0.18 | 0.082 | 0.069 |
| 4.444999999999843 | 0.18 | 0.082 | 0.069 |
| 4.449999999999842 | 0.18 | 0.082 | 0.069 |
| 4.454999999999843 | 0.18 | 0.082 | 0.069 |
| 4.459999999999842 | 0.181 | 0.082 | 0.069 |
| 4.464999999999843 | 0.181 | 0.082 | 0.069 |
| 4.469999999999842 | 0.181 | 0.082 | 0.069 |
| 4.474999999999842 | 0.181 | 0.082 | 0.069 |
| 4.479999999999842 | 0.181 | 0.082 | 0.069 |
| 4.484999999999842 | 0.181 | 0.082 | 0.069 |
| 4.489999999999842 | 0.181 | 0.082 | 0.069 |
| 4.494999999999842 | 0.182 | 0.082 | 0.069 |
| 4.499999999999841 | 0.182 | 0.082 | 0.069 |
| 4.504999999999842 | 0.182 | 0.082 | 0.069 |
| 4.509999999999841 | 0.182 | 0.082 | 0.069 |
| 4.514999999999842 | 0.182 | 0.082 | 0.069 |
| 4.519999999999841 | 0.182 | 0.082 | 0.069 |
| 4.524999999999841 | 0.183 | 0.082 | 0.069 |
| 4.529999999999841 | 0.183 | 0.082 | 0.069 |
| 4.534999999999841 | 0.183 | 0.082 | 0.069 |
| 4.53999999999984 | 0.183 | 0.081 | 0.069 |
| 4.544999999999841 | 0.183 | 0.081 | 0.069 |
| 4.54999999999984 | 0.183 | 0.081 | 0.069 |
| 4.554999999999841 | 0.184 | 0.081 | 0.069 |
| 4.55999999999984 | 0.184 | 0.081 | 0.069 |
| 4.564999999999841 | 0.184 | 0.081 | 0.069 |
| 4.56999999999984 | 0.184 | 0.081 | 0.069 |
| 4.57499999999984 | 0.184 | 0.081 | 0.069 |
| 4.57999999999984 | 0.185 | 0.081 | 0.069 |
| 4.58499999999984 | 0.185 | 0.081 | 0.069 |
| 4.58999999999984 | 0.185 | 0.081 | 0.069 |
| 4.59499999999984 | 0.185 | 0.081 | 0.069 |
| 4.59999999999984 | 0.185 | 0.081 | 0.068 |
| 4.60499999999984 | 0.185 | 0.081 | 0.068 |
| 4.60999999999984 | 0.186 | 0.081 | 0.068 |
| 4.614999999999839 | 0.186 | 0.081 | 0.068 |
| 4.61999999999984 | 0.186 | 0.081 | 0.068 |
| 4.624999999999839 | 0.186 | 0.081 | 0.068 |
| 4.62999999999984 | 0.186 | 0.081 | 0.068 |
| 4.634999999999839 | 0.186 | 0.081 | 0.068 |
| 4.639999999999838 | 0.187 | 0.081 | 0.068 |
| 4.644999999999839 | 0.187 | 0.081 | 0.068 |
| 4.649999999999838 | 0.187 | 0.081 | 0.068 |
| 4.654999999999839 | 0.187 | 0.081 | 0.068 |
| 4.659999999999838 | 0.187 | 0.081 | 0.068 |
| 4.664999999999838 | 0.187 | 0.081 | 0.068 |
| 4.669999999999838 | 0.188 | 0.081 | 0.068 |
| 4.674999999999838 | 0.188 | 0.081 | 0.068 |
| 4.679999999999837 | 0.188 | 0.081 | 0.068 |
| 4.684999999999838 | 0.188 | 0.081 | 0.068 |
| 4.689999999999837 | 0.188 | 0.081 | 0.068 |
| 4.694999999999838 | 0.189 | 0.081 | 0.068 |
| 4.699999999999837 | 0.189 | 0.081 | 0.068 |
| 4.704999999999837 | 0.189 | 0.081 | 0.068 |
| 4.709999999999837 | 0.189 | 0.081 | 0.068 |
| 4.714999999999837 | 0.189 | 0.081 | 0.068 |
| 4.719999999999837 | 0.189 | 0.081 | 0.068 |
| 4.724999999999837 | 0.19 | 0.081 | 0.068 |
| 4.729999999999836 | 0.19 | 0.081 | 0.068 |
| 4.734999999999836 | 0.19 | 0.081 | 0.068 |
| 4.739999999999836 | 0.19 | 0.081 | 0.068 |
| 4.744999999999836 | 0.19 | 0.081 | 0.068 |
| 4.749999999999836 | 0.19 | 0.081 | 0.068 |
| 4.754999999999836 | 0.191 | 0.081 | 0.068 |
| 4.759999999999836 | 0.191 | 0.081 | 0.068 |
| 4.764999999999836 | 0.191 | 0.081 | 0.068 |
| 4.769999999999836 | 0.191 | 0.081 | 0.068 |
| 4.774999999999835 | 0.191 | 0.081 | 0.068 |
| 4.779999999999835 | 0.192 | 0.081 | 0.068 |
| 4.784999999999835 | 0.192 | 0.081 | 0.068 |
| 4.789999999999835 | 0.192 | 0.081 | 0.068 |
| 4.794999999999835 | 0.192 | 0.081 | 0.068 |
| 4.799999999999835 | 0.192 | 0.081 | 0.068 |
| 4.804999999999835 | 0.192 | 0.081 | 0.068 |
| 4.809999999999835 | 0.193 | 0.081 | 0.068 |
| 4.814999999999835 | 0.193 | 0.081 | 0.067 |
| 4.819999999999835 | 0.193 | 0.081 | 0.067 |
| 4.824999999999835 | 0.193 | 0.081 | 0.067 |
| 4.829999999999834 | 0.193 | 0.081 | 0.067 |
| 4.834999999999834 | 0.194 | 0.081 | 0.067 |
| 4.839999999999834 | 0.194 | 0.081 | 0.067 |
| 4.844999999999834 | 0.194 | 0.08 | 0.067 |
| 4.849999999999834 | 0.194 | 0.08 | 0.067 |
| 4.854999999999834 | 0.194 | 0.08 | 0.067 |
| 4.859999999999834 | 0.195 | 0.08 | 0.067 |
| 4.864999999999834 | 0.195 | 0.08 | 0.067 |
| 4.869999999999834 | 0.195 | 0.08 | 0.067 |
| 4.874999999999834 | 0.195 | 0.08 | 0.067 |
| 4.879999999999833 | 0.195 | 0.08 | 0.067 |
| 4.884999999999834 | 0.196 | 0.08 | 0.067 |
| 4.889999999999833 | 0.196 | 0.08 | 0.067 |
| 4.894999999999833 | 0.196 | 0.08 | 0.067 |
| 4.899999999999833 | 0.196 | 0.08 | 0.067 |
| 4.904999999999833 | 0.196 | 0.08 | 0.067 |
| 4.909999999999833 | 0.196 | 0.08 | 0.067 |
| 4.914999999999833 | 0.197 | 0.08 | 0.067 |
| 4.919999999999832 | 0.197 | 0.08 | 0.067 |
| 4.924999999999833 | 0.197 | 0.08 | 0.067 |
| 4.929999999999832 | 0.197 | 0.08 | 0.067 |
| 4.934999999999832 | 0.197 | 0.08 | 0.067 |
| 4.939999999999832 | 0.198 | 0.08 | 0.067 |
| 4.944999999999832 | 0.198 | 0.08 | 0.067 |
| 4.949999999999832 | 0.198 | 0.08 | 0.067 |
| 4.954999999999832 | 0.198 | 0.08 | 0.067 |
| 4.959999999999832 | 0.198 | 0.08 | 0.067 |
| 4.964999999999832 | 0.199 | 0.08 | 0.067 |
| 4.969999999999831 | 0.199 | 0.08 | 0.067 |
| 4.974999999999831 | 0.199 | 0.08 | 0.067 |
| 4.97999999999983 | 0.199 | 0.08 | 0.067 |
| 4.984999999999831 | 0.199 | 0.08 | 0.067 |
| 4.98999999999983 | 0.2 | 0.08 | 0.067 |
| 4.994999999999831 | 0.2 | 0.08 | 0.067 |
| 4.99999999999983 | 0.2 | 0.08 | 0.067 |